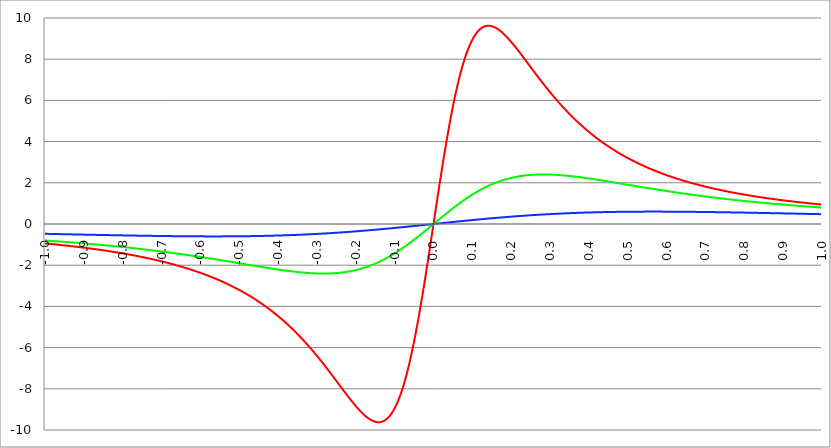
| Category | Series 1 | Series 0 | Series 2 |
|---|---|---|---|
| -1.0 | -0.943 | -0.8 | -0.476 |
| -0.999 | -0.945 | -0.802 | -0.477 |
| -0.998 | -0.946 | -0.803 | -0.477 |
| -0.997 | -0.948 | -0.804 | -0.477 |
| -0.996 | -0.95 | -0.806 | -0.478 |
| -0.995 | -0.952 | -0.807 | -0.478 |
| -0.994 | -0.954 | -0.808 | -0.479 |
| -0.993 | -0.955 | -0.809 | -0.479 |
| -0.992 | -0.957 | -0.811 | -0.479 |
| -0.991 | -0.959 | -0.812 | -0.48 |
| -0.99 | -0.961 | -0.813 | -0.48 |
| -0.989 | -0.963 | -0.815 | -0.48 |
| -0.988 | -0.965 | -0.816 | -0.481 |
| -0.987 | -0.966 | -0.817 | -0.481 |
| -0.986 | -0.968 | -0.818 | -0.482 |
| -0.985 | -0.97 | -0.82 | -0.482 |
| -0.984 | -0.972 | -0.821 | -0.482 |
| -0.983 | -0.974 | -0.822 | -0.483 |
| -0.982 | -0.976 | -0.824 | -0.483 |
| -0.981 | -0.978 | -0.825 | -0.484 |
| -0.98 | -0.979 | -0.826 | -0.484 |
| -0.979 | -0.981 | -0.828 | -0.484 |
| -0.978 | -0.983 | -0.829 | -0.485 |
| -0.977 | -0.985 | -0.83 | -0.485 |
| -0.976 | -0.987 | -0.832 | -0.486 |
| -0.975 | -0.989 | -0.833 | -0.486 |
| -0.974 | -0.991 | -0.834 | -0.486 |
| -0.973 | -0.993 | -0.836 | -0.487 |
| -0.972 | -0.995 | -0.837 | -0.487 |
| -0.971 | -0.997 | -0.838 | -0.488 |
| -0.97 | -0.998 | -0.84 | -0.488 |
| -0.969 | -1 | -0.841 | -0.488 |
| -0.968 | -1.002 | -0.842 | -0.489 |
| -0.967 | -1.004 | -0.844 | -0.489 |
| -0.966 | -1.006 | -0.845 | -0.49 |
| -0.965 | -1.008 | -0.847 | -0.49 |
| -0.964 | -1.01 | -0.848 | -0.49 |
| -0.963 | -1.012 | -0.849 | -0.491 |
| -0.962 | -1.014 | -0.851 | -0.491 |
| -0.961 | -1.016 | -0.852 | -0.492 |
| -0.96 | -1.018 | -0.853 | -0.492 |
| -0.959 | -1.02 | -0.855 | -0.492 |
| -0.958 | -1.022 | -0.856 | -0.493 |
| -0.957 | -1.024 | -0.858 | -0.493 |
| -0.956 | -1.026 | -0.859 | -0.494 |
| -0.955 | -1.028 | -0.86 | -0.494 |
| -0.954 | -1.03 | -0.862 | -0.494 |
| -0.953 | -1.032 | -0.863 | -0.495 |
| -0.952 | -1.034 | -0.865 | -0.495 |
| -0.951 | -1.036 | -0.866 | -0.495 |
| -0.95 | -1.038 | -0.867 | -0.496 |
| -0.949 | -1.04 | -0.869 | -0.496 |
| -0.948 | -1.042 | -0.87 | -0.497 |
| -0.947 | -1.044 | -0.872 | -0.497 |
| -0.946 | -1.046 | -0.873 | -0.497 |
| -0.945 | -1.049 | -0.875 | -0.498 |
| -0.944 | -1.051 | -0.876 | -0.498 |
| -0.943 | -1.053 | -0.877 | -0.499 |
| -0.942 | -1.055 | -0.879 | -0.499 |
| -0.941 | -1.057 | -0.88 | -0.499 |
| -0.94 | -1.059 | -0.882 | -0.5 |
| -0.939 | -1.061 | -0.883 | -0.5 |
| -0.938 | -1.063 | -0.885 | -0.501 |
| -0.937 | -1.065 | -0.886 | -0.501 |
| -0.936 | -1.067 | -0.888 | -0.501 |
| -0.935 | -1.07 | -0.889 | -0.502 |
| -0.934 | -1.072 | -0.89 | -0.502 |
| -0.933 | -1.074 | -0.892 | -0.503 |
| -0.932 | -1.076 | -0.893 | -0.503 |
| -0.931 | -1.078 | -0.895 | -0.503 |
| -0.93 | -1.08 | -0.896 | -0.504 |
| -0.929 | -1.083 | -0.898 | -0.504 |
| -0.928 | -1.085 | -0.899 | -0.505 |
| -0.927 | -1.087 | -0.901 | -0.505 |
| -0.926 | -1.089 | -0.902 | -0.505 |
| -0.925 | -1.091 | -0.904 | -0.506 |
| -0.924 | -1.094 | -0.905 | -0.506 |
| -0.923 | -1.096 | -0.907 | -0.507 |
| -0.922 | -1.098 | -0.908 | -0.507 |
| -0.921 | -1.1 | -0.91 | -0.507 |
| -0.92 | -1.102 | -0.911 | -0.508 |
| -0.919 | -1.105 | -0.913 | -0.508 |
| -0.918 | -1.107 | -0.914 | -0.508 |
| -0.917 | -1.109 | -0.916 | -0.509 |
| -0.916 | -1.111 | -0.917 | -0.509 |
| -0.915 | -1.114 | -0.919 | -0.51 |
| -0.914 | -1.116 | -0.92 | -0.51 |
| -0.913 | -1.118 | -0.922 | -0.51 |
| -0.912 | -1.12 | -0.923 | -0.511 |
| -0.911 | -1.123 | -0.925 | -0.511 |
| -0.91 | -1.125 | -0.926 | -0.512 |
| -0.909 | -1.127 | -0.928 | -0.512 |
| -0.908 | -1.13 | -0.93 | -0.512 |
| -0.907 | -1.132 | -0.931 | -0.513 |
| -0.906 | -1.134 | -0.933 | -0.513 |
| -0.905 | -1.137 | -0.934 | -0.514 |
| -0.904 | -1.139 | -0.936 | -0.514 |
| -0.903 | -1.141 | -0.937 | -0.514 |
| -0.902 | -1.144 | -0.939 | -0.515 |
| -0.901 | -1.146 | -0.94 | -0.515 |
| -0.9 | -1.148 | -0.942 | -0.515 |
| -0.899 | -1.151 | -0.944 | -0.516 |
| -0.898 | -1.153 | -0.945 | -0.516 |
| -0.897 | -1.156 | -0.947 | -0.517 |
| -0.896 | -1.158 | -0.948 | -0.517 |
| -0.895 | -1.16 | -0.95 | -0.517 |
| -0.894 | -1.163 | -0.952 | -0.518 |
| -0.893 | -1.165 | -0.953 | -0.518 |
| -0.892 | -1.168 | -0.955 | -0.519 |
| -0.891 | -1.17 | -0.956 | -0.519 |
| -0.89 | -1.173 | -0.958 | -0.519 |
| -0.889 | -1.175 | -0.96 | -0.52 |
| -0.888 | -1.177 | -0.961 | -0.52 |
| -0.887 | -1.18 | -0.963 | -0.52 |
| -0.886 | -1.182 | -0.964 | -0.521 |
| -0.885 | -1.185 | -0.966 | -0.521 |
| -0.884 | -1.187 | -0.968 | -0.522 |
| -0.883 | -1.19 | -0.969 | -0.522 |
| -0.882 | -1.192 | -0.971 | -0.522 |
| -0.881 | -1.195 | -0.973 | -0.523 |
| -0.88 | -1.197 | -0.974 | -0.523 |
| -0.879 | -1.2 | -0.976 | -0.524 |
| -0.878 | -1.202 | -0.978 | -0.524 |
| -0.877 | -1.205 | -0.979 | -0.524 |
| -0.876 | -1.208 | -0.981 | -0.525 |
| -0.875 | -1.21 | -0.983 | -0.525 |
| -0.874 | -1.213 | -0.984 | -0.525 |
| -0.873 | -1.215 | -0.986 | -0.526 |
| -0.872 | -1.218 | -0.988 | -0.526 |
| -0.871 | -1.22 | -0.989 | -0.527 |
| -0.87 | -1.223 | -0.991 | -0.527 |
| -0.869 | -1.226 | -0.993 | -0.527 |
| -0.868 | -1.228 | -0.994 | -0.528 |
| -0.867 | -1.231 | -0.996 | -0.528 |
| -0.866 | -1.233 | -0.998 | -0.528 |
| -0.865 | -1.236 | -0.999 | -0.529 |
| -0.864 | -1.239 | -1.001 | -0.529 |
| -0.863 | -1.241 | -1.003 | -0.53 |
| -0.862 | -1.244 | -1.004 | -0.53 |
| -0.861 | -1.247 | -1.006 | -0.53 |
| -0.86 | -1.249 | -1.008 | -0.531 |
| -0.859 | -1.252 | -1.01 | -0.531 |
| -0.858 | -1.255 | -1.011 | -0.531 |
| -0.857 | -1.257 | -1.013 | -0.532 |
| -0.856 | -1.26 | -1.015 | -0.532 |
| -0.855 | -1.263 | -1.017 | -0.533 |
| -0.854 | -1.266 | -1.018 | -0.533 |
| -0.853 | -1.268 | -1.02 | -0.533 |
| -0.852 | -1.271 | -1.022 | -0.534 |
| -0.851 | -1.274 | -1.024 | -0.534 |
| -0.85 | -1.277 | -1.025 | -0.534 |
| -0.849 | -1.279 | -1.027 | -0.535 |
| -0.848 | -1.282 | -1.029 | -0.535 |
| -0.847 | -1.285 | -1.031 | -0.536 |
| -0.846 | -1.288 | -1.032 | -0.536 |
| -0.845 | -1.291 | -1.034 | -0.536 |
| -0.844 | -1.293 | -1.036 | -0.537 |
| -0.843 | -1.296 | -1.038 | -0.537 |
| -0.842 | -1.299 | -1.039 | -0.537 |
| -0.841 | -1.302 | -1.041 | -0.538 |
| -0.84 | -1.305 | -1.043 | -0.538 |
| -0.839 | -1.308 | -1.045 | -0.539 |
| -0.838 | -1.31 | -1.047 | -0.539 |
| -0.837 | -1.313 | -1.048 | -0.539 |
| -0.836 | -1.316 | -1.05 | -0.54 |
| -0.835 | -1.319 | -1.052 | -0.54 |
| -0.834 | -1.322 | -1.054 | -0.54 |
| -0.833 | -1.325 | -1.056 | -0.541 |
| -0.832 | -1.328 | -1.058 | -0.541 |
| -0.831 | -1.331 | -1.059 | -0.541 |
| -0.83 | -1.334 | -1.061 | -0.542 |
| -0.829 | -1.337 | -1.063 | -0.542 |
| -0.828 | -1.34 | -1.065 | -0.543 |
| -0.827 | -1.343 | -1.067 | -0.543 |
| -0.826 | -1.346 | -1.069 | -0.543 |
| -0.825 | -1.349 | -1.07 | -0.544 |
| -0.824 | -1.352 | -1.072 | -0.544 |
| -0.823 | -1.355 | -1.074 | -0.544 |
| -0.822 | -1.358 | -1.076 | -0.545 |
| -0.821 | -1.361 | -1.078 | -0.545 |
| -0.82 | -1.364 | -1.08 | -0.545 |
| -0.819 | -1.367 | -1.082 | -0.546 |
| -0.818 | -1.37 | -1.083 | -0.546 |
| -0.817 | -1.373 | -1.085 | -0.546 |
| -0.816 | -1.376 | -1.087 | -0.547 |
| -0.815 | -1.379 | -1.089 | -0.547 |
| -0.814 | -1.382 | -1.091 | -0.548 |
| -0.813 | -1.385 | -1.093 | -0.548 |
| -0.812 | -1.388 | -1.095 | -0.548 |
| -0.811 | -1.392 | -1.097 | -0.549 |
| -0.81 | -1.395 | -1.099 | -0.549 |
| -0.809 | -1.398 | -1.101 | -0.549 |
| -0.808 | -1.401 | -1.103 | -0.55 |
| -0.807 | -1.404 | -1.104 | -0.55 |
| -0.806 | -1.407 | -1.106 | -0.55 |
| -0.805 | -1.411 | -1.108 | -0.551 |
| -0.804 | -1.414 | -1.11 | -0.551 |
| -0.803 | -1.417 | -1.112 | -0.551 |
| -0.802 | -1.42 | -1.114 | -0.552 |
| -0.801 | -1.423 | -1.116 | -0.552 |
| -0.8 | -1.427 | -1.118 | -0.552 |
| -0.799 | -1.43 | -1.12 | -0.553 |
| -0.798 | -1.433 | -1.122 | -0.553 |
| -0.797 | -1.436 | -1.124 | -0.553 |
| -0.796 | -1.44 | -1.126 | -0.554 |
| -0.795 | -1.443 | -1.128 | -0.554 |
| -0.794 | -1.446 | -1.13 | -0.554 |
| -0.793 | -1.45 | -1.132 | -0.555 |
| -0.792 | -1.453 | -1.134 | -0.555 |
| -0.791 | -1.456 | -1.136 | -0.556 |
| -0.79 | -1.46 | -1.138 | -0.556 |
| -0.789 | -1.463 | -1.14 | -0.556 |
| -0.788 | -1.466 | -1.142 | -0.557 |
| -0.787 | -1.47 | -1.144 | -0.557 |
| -0.786 | -1.473 | -1.146 | -0.557 |
| -0.785 | -1.477 | -1.148 | -0.558 |
| -0.784 | -1.48 | -1.15 | -0.558 |
| -0.783 | -1.484 | -1.152 | -0.558 |
| -0.782 | -1.487 | -1.154 | -0.559 |
| -0.781 | -1.49 | -1.156 | -0.559 |
| -0.78 | -1.494 | -1.158 | -0.559 |
| -0.779 | -1.497 | -1.16 | -0.56 |
| -0.778 | -1.501 | -1.162 | -0.56 |
| -0.777 | -1.504 | -1.164 | -0.56 |
| -0.776 | -1.508 | -1.166 | -0.561 |
| -0.775 | -1.511 | -1.168 | -0.561 |
| -0.774 | -1.515 | -1.17 | -0.561 |
| -0.773 | -1.519 | -1.172 | -0.561 |
| -0.772 | -1.522 | -1.174 | -0.562 |
| -0.771 | -1.526 | -1.177 | -0.562 |
| -0.77 | -1.529 | -1.179 | -0.562 |
| -0.769 | -1.533 | -1.181 | -0.563 |
| -0.768 | -1.536 | -1.183 | -0.563 |
| -0.767 | -1.54 | -1.185 | -0.563 |
| -0.766 | -1.544 | -1.187 | -0.564 |
| -0.765 | -1.547 | -1.189 | -0.564 |
| -0.764 | -1.551 | -1.191 | -0.564 |
| -0.763 | -1.555 | -1.193 | -0.565 |
| -0.762 | -1.558 | -1.195 | -0.565 |
| -0.761 | -1.562 | -1.198 | -0.565 |
| -0.76 | -1.566 | -1.2 | -0.566 |
| -0.759 | -1.57 | -1.202 | -0.566 |
| -0.758 | -1.573 | -1.204 | -0.566 |
| -0.757 | -1.577 | -1.206 | -0.567 |
| -0.756 | -1.581 | -1.208 | -0.567 |
| -0.755 | -1.585 | -1.21 | -0.567 |
| -0.754 | -1.588 | -1.213 | -0.568 |
| -0.753 | -1.592 | -1.215 | -0.568 |
| -0.752 | -1.596 | -1.217 | -0.568 |
| -0.751 | -1.6 | -1.219 | -0.568 |
| -0.75 | -1.604 | -1.221 | -0.569 |
| -0.749 | -1.608 | -1.223 | -0.569 |
| -0.748 | -1.611 | -1.226 | -0.569 |
| -0.747 | -1.615 | -1.228 | -0.57 |
| -0.746 | -1.619 | -1.23 | -0.57 |
| -0.745 | -1.623 | -1.232 | -0.57 |
| -0.744 | -1.627 | -1.234 | -0.571 |
| -0.743 | -1.631 | -1.237 | -0.571 |
| -0.742 | -1.635 | -1.239 | -0.571 |
| -0.741 | -1.639 | -1.241 | -0.571 |
| -0.74 | -1.643 | -1.243 | -0.572 |
| -0.739 | -1.647 | -1.245 | -0.572 |
| -0.738 | -1.651 | -1.248 | -0.572 |
| -0.737 | -1.655 | -1.25 | -0.573 |
| -0.736 | -1.659 | -1.252 | -0.573 |
| -0.735 | -1.663 | -1.254 | -0.573 |
| -0.734 | -1.667 | -1.257 | -0.574 |
| -0.733 | -1.671 | -1.259 | -0.574 |
| -0.732 | -1.675 | -1.261 | -0.574 |
| -0.731 | -1.679 | -1.263 | -0.574 |
| -0.73 | -1.683 | -1.266 | -0.575 |
| -0.729 | -1.688 | -1.268 | -0.575 |
| -0.728 | -1.692 | -1.27 | -0.575 |
| -0.727 | -1.696 | -1.272 | -0.576 |
| -0.726 | -1.7 | -1.275 | -0.576 |
| -0.725 | -1.704 | -1.277 | -0.576 |
| -0.724 | -1.709 | -1.279 | -0.576 |
| -0.723 | -1.713 | -1.282 | -0.577 |
| -0.722 | -1.717 | -1.284 | -0.577 |
| -0.721 | -1.721 | -1.286 | -0.577 |
| -0.72 | -1.725 | -1.289 | -0.577 |
| -0.719 | -1.73 | -1.291 | -0.578 |
| -0.718 | -1.734 | -1.293 | -0.578 |
| -0.717 | -1.738 | -1.296 | -0.578 |
| -0.716 | -1.743 | -1.298 | -0.579 |
| -0.715 | -1.747 | -1.3 | -0.579 |
| -0.714 | -1.751 | -1.303 | -0.579 |
| -0.713 | -1.756 | -1.305 | -0.579 |
| -0.712 | -1.76 | -1.307 | -0.58 |
| -0.711 | -1.765 | -1.31 | -0.58 |
| -0.71 | -1.769 | -1.312 | -0.58 |
| -0.709 | -1.773 | -1.314 | -0.58 |
| -0.708 | -1.778 | -1.317 | -0.581 |
| -0.707 | -1.782 | -1.319 | -0.581 |
| -0.706 | -1.787 | -1.321 | -0.581 |
| -0.705 | -1.791 | -1.324 | -0.581 |
| -0.704 | -1.796 | -1.326 | -0.582 |
| -0.703 | -1.8 | -1.329 | -0.582 |
| -0.702 | -1.805 | -1.331 | -0.582 |
| -0.701 | -1.81 | -1.333 | -0.582 |
| -0.7 | -1.814 | -1.336 | -0.583 |
| -0.699 | -1.819 | -1.338 | -0.583 |
| -0.698 | -1.823 | -1.341 | -0.583 |
| -0.697 | -1.828 | -1.343 | -0.583 |
| -0.696 | -1.833 | -1.345 | -0.584 |
| -0.695 | -1.837 | -1.348 | -0.584 |
| -0.694 | -1.842 | -1.35 | -0.584 |
| -0.693 | -1.847 | -1.353 | -0.584 |
| -0.692 | -1.852 | -1.355 | -0.585 |
| -0.691 | -1.856 | -1.358 | -0.585 |
| -0.69 | -1.861 | -1.36 | -0.585 |
| -0.689 | -1.866 | -1.363 | -0.585 |
| -0.688 | -1.871 | -1.365 | -0.586 |
| -0.687 | -1.875 | -1.367 | -0.586 |
| -0.686 | -1.88 | -1.37 | -0.586 |
| -0.685 | -1.885 | -1.372 | -0.586 |
| -0.684 | -1.89 | -1.375 | -0.587 |
| -0.683 | -1.895 | -1.377 | -0.587 |
| -0.682 | -1.9 | -1.38 | -0.587 |
| -0.681 | -1.905 | -1.382 | -0.587 |
| -0.68 | -1.91 | -1.385 | -0.587 |
| -0.679 | -1.915 | -1.387 | -0.588 |
| -0.678 | -1.919 | -1.39 | -0.588 |
| -0.677 | -1.924 | -1.392 | -0.588 |
| -0.676 | -1.929 | -1.395 | -0.588 |
| -0.675 | -1.935 | -1.397 | -0.589 |
| -0.674 | -1.94 | -1.4 | -0.589 |
| -0.673 | -1.945 | -1.402 | -0.589 |
| -0.672 | -1.95 | -1.405 | -0.589 |
| -0.671 | -1.955 | -1.408 | -0.589 |
| -0.67 | -1.96 | -1.41 | -0.59 |
| -0.669 | -1.965 | -1.413 | -0.59 |
| -0.668 | -1.97 | -1.415 | -0.59 |
| -0.667 | -1.975 | -1.418 | -0.59 |
| -0.666 | -1.981 | -1.42 | -0.59 |
| -0.665 | -1.986 | -1.423 | -0.591 |
| -0.664 | -1.991 | -1.426 | -0.591 |
| -0.663 | -1.996 | -1.428 | -0.591 |
| -0.662 | -2.002 | -1.431 | -0.591 |
| -0.661 | -2.007 | -1.433 | -0.591 |
| -0.66 | -2.012 | -1.436 | -0.592 |
| -0.659 | -2.018 | -1.438 | -0.592 |
| -0.658 | -2.023 | -1.441 | -0.592 |
| -0.657 | -2.028 | -1.444 | -0.592 |
| -0.656 | -2.034 | -1.446 | -0.592 |
| -0.655 | -2.039 | -1.449 | -0.593 |
| -0.654 | -2.045 | -1.452 | -0.593 |
| -0.653 | -2.05 | -1.454 | -0.593 |
| -0.652 | -2.056 | -1.457 | -0.593 |
| -0.651 | -2.061 | -1.459 | -0.593 |
| -0.65 | -2.067 | -1.462 | -0.593 |
| -0.649 | -2.072 | -1.465 | -0.594 |
| -0.648 | -2.078 | -1.467 | -0.594 |
| -0.647 | -2.083 | -1.47 | -0.594 |
| -0.646 | -2.089 | -1.473 | -0.594 |
| -0.645 | -2.094 | -1.475 | -0.594 |
| -0.644 | -2.1 | -1.478 | -0.595 |
| -0.643 | -2.106 | -1.481 | -0.595 |
| -0.642 | -2.111 | -1.483 | -0.595 |
| -0.641 | -2.117 | -1.486 | -0.595 |
| -0.64 | -2.123 | -1.489 | -0.595 |
| -0.639 | -2.129 | -1.491 | -0.595 |
| -0.638 | -2.134 | -1.494 | -0.595 |
| -0.637 | -2.14 | -1.497 | -0.596 |
| -0.636 | -2.146 | -1.5 | -0.596 |
| -0.635 | -2.152 | -1.502 | -0.596 |
| -0.634 | -2.158 | -1.505 | -0.596 |
| -0.633 | -2.164 | -1.508 | -0.596 |
| -0.632 | -2.17 | -1.51 | -0.596 |
| -0.631 | -2.176 | -1.513 | -0.597 |
| -0.63 | -2.182 | -1.516 | -0.597 |
| -0.629 | -2.188 | -1.519 | -0.597 |
| -0.628 | -2.194 | -1.521 | -0.597 |
| -0.627 | -2.2 | -1.524 | -0.597 |
| -0.626 | -2.206 | -1.527 | -0.597 |
| -0.625 | -2.212 | -1.53 | -0.597 |
| -0.624 | -2.218 | -1.532 | -0.597 |
| -0.623 | -2.224 | -1.535 | -0.598 |
| -0.622 | -2.23 | -1.538 | -0.598 |
| -0.621 | -2.236 | -1.541 | -0.598 |
| -0.62 | -2.242 | -1.544 | -0.598 |
| -0.619 | -2.249 | -1.546 | -0.598 |
| -0.618 | -2.255 | -1.549 | -0.598 |
| -0.617 | -2.261 | -1.552 | -0.598 |
| -0.616 | -2.268 | -1.555 | -0.598 |
| -0.615 | -2.274 | -1.558 | -0.599 |
| -0.614 | -2.28 | -1.56 | -0.599 |
| -0.613 | -2.287 | -1.563 | -0.599 |
| -0.612 | -2.293 | -1.566 | -0.599 |
| -0.611 | -2.299 | -1.569 | -0.599 |
| -0.61 | -2.306 | -1.572 | -0.599 |
| -0.609 | -2.312 | -1.574 | -0.599 |
| -0.608 | -2.319 | -1.577 | -0.599 |
| -0.607 | -2.325 | -1.58 | -0.599 |
| -0.606 | -2.332 | -1.583 | -0.599 |
| -0.605 | -2.338 | -1.586 | -0.6 |
| -0.604 | -2.345 | -1.589 | -0.6 |
| -0.603 | -2.352 | -1.592 | -0.6 |
| -0.602 | -2.358 | -1.594 | -0.6 |
| -0.601 | -2.365 | -1.597 | -0.6 |
| -0.6 | -2.372 | -1.6 | -0.6 |
| -0.599 | -2.378 | -1.603 | -0.6 |
| -0.598 | -2.385 | -1.606 | -0.6 |
| -0.597 | -2.392 | -1.609 | -0.6 |
| -0.596 | -2.399 | -1.612 | -0.6 |
| -0.595 | -2.406 | -1.615 | -0.6 |
| -0.594 | -2.413 | -1.617 | -0.6 |
| -0.593 | -2.419 | -1.62 | -0.601 |
| -0.592 | -2.426 | -1.623 | -0.601 |
| -0.591 | -2.433 | -1.626 | -0.601 |
| -0.59 | -2.44 | -1.629 | -0.601 |
| -0.589 | -2.447 | -1.632 | -0.601 |
| -0.588 | -2.454 | -1.635 | -0.601 |
| -0.587 | -2.461 | -1.638 | -0.601 |
| -0.586 | -2.468 | -1.641 | -0.601 |
| -0.585 | -2.476 | -1.644 | -0.601 |
| -0.584 | -2.483 | -1.647 | -0.601 |
| -0.583 | -2.49 | -1.65 | -0.601 |
| -0.582 | -2.497 | -1.652 | -0.601 |
| -0.581 | -2.504 | -1.655 | -0.601 |
| -0.58 | -2.512 | -1.658 | -0.601 |
| -0.579 | -2.519 | -1.661 | -0.601 |
| -0.578 | -2.526 | -1.664 | -0.601 |
| -0.577 | -2.534 | -1.667 | -0.601 |
| -0.576 | -2.541 | -1.67 | -0.601 |
| -0.575 | -2.548 | -1.673 | -0.601 |
| -0.574 | -2.556 | -1.676 | -0.601 |
| -0.573 | -2.563 | -1.679 | -0.601 |
| -0.572 | -2.571 | -1.682 | -0.601 |
| -0.571 | -2.578 | -1.685 | -0.601 |
| -0.57 | -2.586 | -1.688 | -0.601 |
| -0.569 | -2.594 | -1.691 | -0.601 |
| -0.568 | -2.601 | -1.694 | -0.601 |
| -0.567 | -2.609 | -1.697 | -0.601 |
| -0.566 | -2.616 | -1.7 | -0.601 |
| -0.565 | -2.624 | -1.703 | -0.601 |
| -0.564 | -2.632 | -1.706 | -0.601 |
| -0.563 | -2.64 | -1.709 | -0.601 |
| -0.562 | -2.648 | -1.712 | -0.601 |
| -0.561 | -2.655 | -1.715 | -0.601 |
| -0.56 | -2.663 | -1.718 | -0.601 |
| -0.559 | -2.671 | -1.721 | -0.601 |
| -0.558 | -2.679 | -1.724 | -0.601 |
| -0.557 | -2.687 | -1.727 | -0.601 |
| -0.556 | -2.695 | -1.73 | -0.601 |
| -0.555 | -2.703 | -1.733 | -0.601 |
| -0.554 | -2.711 | -1.736 | -0.601 |
| -0.553 | -2.719 | -1.739 | -0.601 |
| -0.552 | -2.728 | -1.743 | -0.601 |
| -0.551 | -2.736 | -1.746 | -0.601 |
| -0.55 | -2.744 | -1.749 | -0.601 |
| -0.549 | -2.752 | -1.752 | -0.601 |
| -0.548 | -2.76 | -1.755 | -0.601 |
| -0.547 | -2.769 | -1.758 | -0.601 |
| -0.546 | -2.777 | -1.761 | -0.601 |
| -0.545 | -2.786 | -1.764 | -0.601 |
| -0.544 | -2.794 | -1.767 | -0.601 |
| -0.543 | -2.802 | -1.77 | -0.601 |
| -0.542 | -2.811 | -1.773 | -0.601 |
| -0.541 | -2.819 | -1.776 | -0.601 |
| -0.54 | -2.828 | -1.779 | -0.601 |
| -0.539 | -2.837 | -1.782 | -0.6 |
| -0.538 | -2.845 | -1.786 | -0.6 |
| -0.537 | -2.854 | -1.789 | -0.6 |
| -0.536 | -2.863 | -1.792 | -0.6 |
| -0.535 | -2.871 | -1.795 | -0.6 |
| -0.534 | -2.88 | -1.798 | -0.6 |
| -0.533 | -2.889 | -1.801 | -0.6 |
| -0.532 | -2.898 | -1.804 | -0.6 |
| -0.531 | -2.907 | -1.807 | -0.6 |
| -0.53 | -2.916 | -1.81 | -0.6 |
| -0.529 | -2.925 | -1.813 | -0.6 |
| -0.528 | -2.934 | -1.817 | -0.6 |
| -0.527 | -2.943 | -1.82 | -0.599 |
| -0.526 | -2.952 | -1.823 | -0.599 |
| -0.525 | -2.961 | -1.826 | -0.599 |
| -0.524 | -2.97 | -1.829 | -0.599 |
| -0.523 | -2.979 | -1.832 | -0.599 |
| -0.522 | -2.988 | -1.835 | -0.599 |
| -0.521 | -2.998 | -1.838 | -0.599 |
| -0.52 | -3.007 | -1.842 | -0.599 |
| -0.519 | -3.016 | -1.845 | -0.598 |
| -0.518 | -3.026 | -1.848 | -0.598 |
| -0.517 | -3.035 | -1.851 | -0.598 |
| -0.516 | -3.045 | -1.854 | -0.598 |
| -0.515 | -3.054 | -1.857 | -0.598 |
| -0.514 | -3.064 | -1.86 | -0.598 |
| -0.513 | -3.073 | -1.864 | -0.598 |
| -0.512 | -3.083 | -1.867 | -0.598 |
| -0.511 | -3.092 | -1.87 | -0.597 |
| -0.51 | -3.102 | -1.873 | -0.597 |
| -0.509 | -3.112 | -1.876 | -0.597 |
| -0.508 | -3.122 | -1.879 | -0.597 |
| -0.507 | -3.132 | -1.882 | -0.597 |
| -0.506 | -3.141 | -1.886 | -0.597 |
| -0.505 | -3.151 | -1.889 | -0.596 |
| -0.504 | -3.161 | -1.892 | -0.596 |
| -0.503 | -3.171 | -1.895 | -0.596 |
| -0.502 | -3.181 | -1.898 | -0.596 |
| -0.501 | -3.192 | -1.901 | -0.596 |
| -0.5 | -3.202 | -1.905 | -0.596 |
| -0.499 | -3.212 | -1.908 | -0.595 |
| -0.498 | -3.222 | -1.911 | -0.595 |
| -0.497 | -3.232 | -1.914 | -0.595 |
| -0.496 | -3.243 | -1.917 | -0.595 |
| -0.495 | -3.253 | -1.92 | -0.595 |
| -0.494 | -3.263 | -1.924 | -0.594 |
| -0.493 | -3.274 | -1.927 | -0.594 |
| -0.492 | -3.284 | -1.93 | -0.594 |
| -0.491 | -3.295 | -1.933 | -0.594 |
| -0.49 | -3.305 | -1.936 | -0.593 |
| -0.489 | -3.316 | -1.939 | -0.593 |
| -0.488 | -3.327 | -1.942 | -0.593 |
| -0.487 | -3.337 | -1.946 | -0.593 |
| -0.486 | -3.348 | -1.949 | -0.593 |
| -0.485 | -3.359 | -1.952 | -0.592 |
| -0.484 | -3.37 | -1.955 | -0.592 |
| -0.483 | -3.381 | -1.958 | -0.592 |
| -0.482 | -3.392 | -1.961 | -0.592 |
| -0.481 | -3.403 | -1.965 | -0.591 |
| -0.48 | -3.414 | -1.968 | -0.591 |
| -0.479 | -3.425 | -1.971 | -0.591 |
| -0.478 | -3.436 | -1.974 | -0.591 |
| -0.477 | -3.447 | -1.977 | -0.59 |
| -0.476 | -3.458 | -1.98 | -0.59 |
| -0.475 | -3.47 | -1.984 | -0.59 |
| -0.474 | -3.481 | -1.987 | -0.59 |
| -0.473 | -3.492 | -1.99 | -0.589 |
| -0.472 | -3.504 | -1.993 | -0.589 |
| -0.471 | -3.515 | -1.996 | -0.589 |
| -0.469999999999999 | -3.527 | -1.999 | -0.588 |
| -0.468999999999999 | -3.538 | -2.002 | -0.588 |
| -0.467999999999999 | -3.55 | -2.006 | -0.588 |
| -0.466999999999999 | -3.562 | -2.009 | -0.588 |
| -0.465999999999999 | -3.573 | -2.012 | -0.587 |
| -0.464999999999999 | -3.585 | -2.015 | -0.587 |
| -0.463999999999999 | -3.597 | -2.018 | -0.587 |
| -0.462999999999999 | -3.609 | -2.021 | -0.586 |
| -0.461999999999999 | -3.621 | -2.024 | -0.586 |
| -0.460999999999999 | -3.633 | -2.028 | -0.586 |
| -0.459999999999999 | -3.645 | -2.031 | -0.585 |
| -0.458999999999999 | -3.657 | -2.034 | -0.585 |
| -0.457999999999999 | -3.669 | -2.037 | -0.585 |
| -0.456999999999999 | -3.681 | -2.04 | -0.584 |
| -0.455999999999999 | -3.694 | -2.043 | -0.584 |
| -0.454999999999999 | -3.706 | -2.046 | -0.584 |
| -0.453999999999999 | -3.718 | -2.049 | -0.583 |
| -0.452999999999999 | -3.731 | -2.053 | -0.583 |
| -0.451999999999999 | -3.743 | -2.056 | -0.583 |
| -0.450999999999999 | -3.756 | -2.059 | -0.582 |
| -0.449999999999999 | -3.768 | -2.062 | -0.582 |
| -0.448999999999999 | -3.781 | -2.065 | -0.582 |
| -0.447999999999999 | -3.794 | -2.068 | -0.581 |
| -0.446999999999999 | -3.806 | -2.071 | -0.581 |
| -0.445999999999999 | -3.819 | -2.074 | -0.58 |
| -0.444999999999999 | -3.832 | -2.077 | -0.58 |
| -0.443999999999999 | -3.845 | -2.08 | -0.58 |
| -0.442999999999999 | -3.858 | -2.083 | -0.579 |
| -0.441999999999999 | -3.871 | -2.086 | -0.579 |
| -0.440999999999999 | -3.884 | -2.09 | -0.579 |
| -0.439999999999999 | -3.897 | -2.093 | -0.578 |
| -0.438999999999999 | -3.91 | -2.096 | -0.578 |
| -0.437999999999999 | -3.924 | -2.099 | -0.577 |
| -0.436999999999999 | -3.937 | -2.102 | -0.577 |
| -0.435999999999999 | -3.95 | -2.105 | -0.576 |
| -0.434999999999999 | -3.964 | -2.108 | -0.576 |
| -0.433999999999999 | -3.977 | -2.111 | -0.576 |
| -0.432999999999999 | -3.991 | -2.114 | -0.575 |
| -0.431999999999999 | -4.004 | -2.117 | -0.575 |
| -0.430999999999999 | -4.018 | -2.12 | -0.574 |
| -0.429999999999999 | -4.032 | -2.123 | -0.574 |
| -0.428999999999999 | -4.045 | -2.126 | -0.574 |
| -0.427999999999999 | -4.059 | -2.129 | -0.573 |
| -0.426999999999999 | -4.073 | -2.132 | -0.573 |
| -0.425999999999999 | -4.087 | -2.135 | -0.572 |
| -0.424999999999999 | -4.101 | -2.138 | -0.572 |
| -0.423999999999999 | -4.115 | -2.141 | -0.571 |
| -0.422999999999999 | -4.129 | -2.144 | -0.571 |
| -0.421999999999999 | -4.144 | -2.147 | -0.57 |
| -0.420999999999999 | -4.158 | -2.15 | -0.57 |
| -0.419999999999999 | -4.172 | -2.153 | -0.569 |
| -0.418999999999999 | -4.187 | -2.156 | -0.569 |
| -0.417999999999999 | -4.201 | -2.158 | -0.568 |
| -0.416999999999999 | -4.216 | -2.161 | -0.568 |
| -0.415999999999999 | -4.23 | -2.164 | -0.567 |
| -0.414999999999999 | -4.245 | -2.167 | -0.567 |
| -0.413999999999999 | -4.259 | -2.17 | -0.566 |
| -0.412999999999999 | -4.274 | -2.173 | -0.566 |
| -0.411999999999999 | -4.289 | -2.176 | -0.565 |
| -0.410999999999999 | -4.304 | -2.179 | -0.565 |
| -0.409999999999999 | -4.319 | -2.182 | -0.564 |
| -0.408999999999999 | -4.334 | -2.184 | -0.564 |
| -0.407999999999999 | -4.349 | -2.187 | -0.563 |
| -0.406999999999999 | -4.364 | -2.19 | -0.563 |
| -0.405999999999999 | -4.379 | -2.193 | -0.562 |
| -0.404999999999999 | -4.395 | -2.196 | -0.562 |
| -0.403999999999999 | -4.41 | -2.199 | -0.561 |
| -0.402999999999999 | -4.425 | -2.201 | -0.561 |
| -0.401999999999999 | -4.441 | -2.204 | -0.56 |
| -0.400999999999999 | -4.457 | -2.207 | -0.56 |
| -0.399999999999999 | -4.472 | -2.21 | -0.559 |
| -0.398999999999999 | -4.488 | -2.212 | -0.558 |
| -0.397999999999999 | -4.504 | -2.215 | -0.558 |
| -0.396999999999999 | -4.519 | -2.218 | -0.557 |
| -0.395999999999999 | -4.535 | -2.221 | -0.557 |
| -0.394999999999999 | -4.551 | -2.223 | -0.556 |
| -0.393999999999999 | -4.567 | -2.226 | -0.556 |
| -0.392999999999999 | -4.583 | -2.229 | -0.555 |
| -0.391999999999999 | -4.6 | -2.231 | -0.554 |
| -0.390999999999999 | -4.616 | -2.234 | -0.554 |
| -0.389999999999999 | -4.632 | -2.237 | -0.553 |
| -0.388999999999999 | -4.648 | -2.239 | -0.553 |
| -0.387999999999999 | -4.665 | -2.242 | -0.552 |
| -0.386999999999999 | -4.681 | -2.245 | -0.551 |
| -0.385999999999999 | -4.698 | -2.247 | -0.551 |
| -0.384999999999999 | -4.715 | -2.25 | -0.55 |
| -0.383999999999999 | -4.731 | -2.252 | -0.55 |
| -0.382999999999999 | -4.748 | -2.255 | -0.549 |
| -0.381999999999999 | -4.765 | -2.258 | -0.548 |
| -0.380999999999999 | -4.782 | -2.26 | -0.548 |
| -0.379999999999999 | -4.799 | -2.263 | -0.547 |
| -0.378999999999999 | -4.816 | -2.265 | -0.546 |
| -0.377999999999999 | -4.833 | -2.268 | -0.546 |
| -0.376999999999999 | -4.85 | -2.27 | -0.545 |
| -0.375999999999999 | -4.868 | -2.273 | -0.544 |
| -0.374999999999999 | -4.885 | -2.275 | -0.544 |
| -0.373999999999999 | -4.902 | -2.278 | -0.543 |
| -0.372999999999999 | -4.92 | -2.28 | -0.542 |
| -0.371999999999999 | -4.938 | -2.282 | -0.542 |
| -0.370999999999999 | -4.955 | -2.285 | -0.541 |
| -0.369999999999999 | -4.973 | -2.287 | -0.54 |
| -0.368999999999999 | -4.991 | -2.289 | -0.54 |
| -0.367999999999999 | -5.009 | -2.292 | -0.539 |
| -0.366999999999999 | -5.027 | -2.294 | -0.538 |
| -0.365999999999999 | -5.045 | -2.296 | -0.538 |
| -0.364999999999999 | -5.063 | -2.299 | -0.537 |
| -0.363999999999999 | -5.081 | -2.301 | -0.536 |
| -0.362999999999999 | -5.099 | -2.303 | -0.535 |
| -0.361999999999999 | -5.117 | -2.306 | -0.535 |
| -0.360999999999999 | -5.136 | -2.308 | -0.534 |
| -0.359999999999999 | -5.154 | -2.31 | -0.533 |
| -0.358999999999999 | -5.173 | -2.312 | -0.532 |
| -0.357999999999999 | -5.191 | -2.314 | -0.532 |
| -0.356999999999999 | -5.21 | -2.316 | -0.531 |
| -0.355999999999999 | -5.229 | -2.319 | -0.53 |
| -0.354999999999999 | -5.248 | -2.321 | -0.529 |
| -0.353999999999999 | -5.267 | -2.323 | -0.529 |
| -0.352999999999999 | -5.286 | -2.325 | -0.528 |
| -0.351999999999999 | -5.305 | -2.327 | -0.527 |
| -0.350999999999999 | -5.324 | -2.329 | -0.526 |
| -0.349999999999999 | -5.343 | -2.331 | -0.526 |
| -0.348999999999999 | -5.362 | -2.333 | -0.525 |
| -0.347999999999999 | -5.382 | -2.335 | -0.524 |
| -0.346999999999999 | -5.401 | -2.337 | -0.523 |
| -0.345999999999999 | -5.421 | -2.339 | -0.523 |
| -0.344999999999999 | -5.44 | -2.341 | -0.522 |
| -0.343999999999999 | -5.46 | -2.343 | -0.521 |
| -0.342999999999999 | -5.48 | -2.344 | -0.52 |
| -0.341999999999999 | -5.5 | -2.346 | -0.519 |
| -0.340999999999999 | -5.519 | -2.348 | -0.518 |
| -0.339999999999999 | -5.539 | -2.35 | -0.518 |
| -0.338999999999999 | -5.559 | -2.352 | -0.517 |
| -0.337999999999999 | -5.58 | -2.353 | -0.516 |
| -0.336999999999999 | -5.6 | -2.355 | -0.515 |
| -0.335999999999999 | -5.62 | -2.357 | -0.514 |
| -0.334999999999999 | -5.64 | -2.359 | -0.513 |
| -0.333999999999999 | -5.661 | -2.36 | -0.513 |
| -0.332999999999999 | -5.681 | -2.362 | -0.512 |
| -0.331999999999999 | -5.702 | -2.363 | -0.511 |
| -0.330999999999999 | -5.723 | -2.365 | -0.51 |
| -0.329999999999999 | -5.743 | -2.367 | -0.509 |
| -0.328999999999999 | -5.764 | -2.368 | -0.508 |
| -0.327999999999999 | -5.785 | -2.37 | -0.507 |
| -0.326999999999999 | -5.806 | -2.371 | -0.507 |
| -0.325999999999999 | -5.827 | -2.373 | -0.506 |
| -0.324999999999999 | -5.848 | -2.374 | -0.505 |
| -0.323999999999999 | -5.869 | -2.375 | -0.504 |
| -0.322999999999999 | -5.891 | -2.377 | -0.503 |
| -0.321999999999999 | -5.912 | -2.378 | -0.502 |
| -0.320999999999999 | -5.934 | -2.379 | -0.501 |
| -0.319999999999999 | -5.955 | -2.381 | -0.5 |
| -0.318999999999999 | -5.977 | -2.382 | -0.499 |
| -0.317999999999999 | -5.998 | -2.383 | -0.498 |
| -0.316999999999999 | -6.02 | -2.384 | -0.497 |
| -0.315999999999999 | -6.042 | -2.386 | -0.497 |
| -0.314999999999999 | -6.064 | -2.387 | -0.496 |
| -0.313999999999999 | -6.086 | -2.388 | -0.495 |
| -0.312999999999999 | -6.108 | -2.389 | -0.494 |
| -0.311999999999999 | -6.13 | -2.39 | -0.493 |
| -0.310999999999999 | -6.152 | -2.391 | -0.492 |
| -0.309999999999999 | -6.174 | -2.392 | -0.491 |
| -0.308999999999999 | -6.196 | -2.393 | -0.49 |
| -0.307999999999999 | -6.219 | -2.394 | -0.489 |
| -0.306999999999999 | -6.241 | -2.395 | -0.488 |
| -0.305999999999999 | -6.264 | -2.396 | -0.487 |
| -0.304999999999999 | -6.286 | -2.396 | -0.486 |
| -0.303999999999999 | -6.309 | -2.397 | -0.485 |
| -0.302999999999999 | -6.332 | -2.398 | -0.484 |
| -0.301999999999999 | -6.355 | -2.399 | -0.483 |
| -0.300999999999999 | -6.377 | -2.399 | -0.482 |
| -0.299999999999999 | -6.4 | -2.4 | -0.481 |
| -0.298999999999999 | -6.423 | -2.401 | -0.48 |
| -0.297999999999999 | -6.446 | -2.401 | -0.479 |
| -0.296999999999999 | -6.47 | -2.402 | -0.478 |
| -0.295999999999999 | -6.493 | -2.402 | -0.477 |
| -0.294999999999999 | -6.516 | -2.403 | -0.476 |
| -0.293999999999999 | -6.539 | -2.403 | -0.475 |
| -0.292999999999999 | -6.563 | -2.404 | -0.474 |
| -0.291999999999999 | -6.586 | -2.404 | -0.473 |
| -0.290999999999999 | -6.61 | -2.404 | -0.472 |
| -0.289999999999999 | -6.633 | -2.405 | -0.471 |
| -0.288999999999999 | -6.657 | -2.405 | -0.47 |
| -0.287999999999999 | -6.681 | -2.405 | -0.469 |
| -0.286999999999999 | -6.705 | -2.405 | -0.467 |
| -0.285999999999999 | -6.728 | -2.405 | -0.466 |
| -0.284999999999999 | -6.752 | -2.406 | -0.465 |
| -0.283999999999999 | -6.776 | -2.406 | -0.464 |
| -0.282999999999999 | -6.8 | -2.406 | -0.463 |
| -0.281999999999999 | -6.824 | -2.406 | -0.462 |
| -0.280999999999999 | -6.849 | -2.406 | -0.461 |
| -0.279999999999999 | -6.873 | -2.405 | -0.46 |
| -0.278999999999999 | -6.897 | -2.405 | -0.459 |
| -0.277999999999999 | -6.921 | -2.405 | -0.458 |
| -0.276999999999999 | -6.946 | -2.405 | -0.457 |
| -0.275999999999999 | -6.97 | -2.405 | -0.455 |
| -0.274999999999999 | -6.994 | -2.404 | -0.454 |
| -0.273999999999999 | -7.019 | -2.404 | -0.453 |
| -0.272999999999999 | -7.044 | -2.404 | -0.452 |
| -0.271999999999999 | -7.068 | -2.403 | -0.451 |
| -0.270999999999999 | -7.093 | -2.403 | -0.45 |
| -0.269999999999999 | -7.117 | -2.402 | -0.449 |
| -0.268999999999999 | -7.142 | -2.402 | -0.447 |
| -0.267999999999999 | -7.167 | -2.401 | -0.446 |
| -0.266999999999999 | -7.192 | -2.4 | -0.445 |
| -0.265999999999999 | -7.217 | -2.4 | -0.444 |
| -0.264999999999999 | -7.241 | -2.399 | -0.443 |
| -0.263999999999999 | -7.266 | -2.398 | -0.442 |
| -0.262999999999999 | -7.291 | -2.397 | -0.44 |
| -0.261999999999999 | -7.316 | -2.396 | -0.439 |
| -0.260999999999999 | -7.341 | -2.395 | -0.438 |
| -0.259999999999999 | -7.366 | -2.395 | -0.437 |
| -0.258999999999999 | -7.391 | -2.393 | -0.436 |
| -0.257999999999999 | -7.417 | -2.392 | -0.434 |
| -0.256999999999999 | -7.442 | -2.391 | -0.433 |
| -0.255999999999999 | -7.467 | -2.39 | -0.432 |
| -0.254999999999999 | -7.492 | -2.389 | -0.431 |
| -0.253999999999999 | -7.517 | -2.388 | -0.43 |
| -0.252999999999999 | -7.542 | -2.386 | -0.428 |
| -0.251999999999999 | -7.568 | -2.385 | -0.427 |
| -0.250999999999999 | -7.593 | -2.383 | -0.426 |
| -0.249999999999999 | -7.618 | -2.382 | -0.425 |
| -0.248999999999999 | -7.644 | -2.38 | -0.423 |
| -0.247999999999999 | -7.669 | -2.379 | -0.422 |
| -0.246999999999999 | -7.694 | -2.377 | -0.421 |
| -0.245999999999999 | -7.719 | -2.376 | -0.42 |
| -0.244999999999999 | -7.745 | -2.374 | -0.418 |
| -0.243999999999999 | -7.77 | -2.372 | -0.417 |
| -0.242999999999999 | -7.795 | -2.37 | -0.416 |
| -0.241999999999999 | -7.821 | -2.368 | -0.414 |
| -0.240999999999999 | -7.846 | -2.366 | -0.413 |
| -0.239999999999999 | -7.871 | -2.364 | -0.412 |
| -0.238999999999999 | -7.896 | -2.362 | -0.411 |
| -0.237999999999999 | -7.922 | -2.36 | -0.409 |
| -0.236999999999999 | -7.947 | -2.358 | -0.408 |
| -0.235999999999999 | -7.972 | -2.356 | -0.407 |
| -0.234999999999999 | -7.997 | -2.354 | -0.405 |
| -0.233999999999999 | -8.022 | -2.351 | -0.404 |
| -0.232999999999999 | -8.048 | -2.349 | -0.403 |
| -0.231999999999999 | -8.073 | -2.346 | -0.401 |
| -0.230999999999999 | -8.098 | -2.344 | -0.4 |
| -0.229999999999999 | -8.123 | -2.341 | -0.399 |
| -0.228999999999999 | -8.148 | -2.339 | -0.397 |
| -0.227999999999999 | -8.173 | -2.336 | -0.396 |
| -0.226999999999999 | -8.198 | -2.333 | -0.395 |
| -0.225999999999999 | -8.222 | -2.331 | -0.393 |
| -0.224999999999999 | -8.247 | -2.328 | -0.392 |
| -0.223999999999999 | -8.272 | -2.325 | -0.391 |
| -0.222999999999999 | -8.297 | -2.322 | -0.389 |
| -0.221999999999999 | -8.321 | -2.319 | -0.388 |
| -0.220999999999999 | -8.346 | -2.316 | -0.387 |
| -0.219999999999999 | -8.37 | -2.312 | -0.385 |
| -0.218999999999999 | -8.395 | -2.309 | -0.384 |
| -0.217999999999999 | -8.419 | -2.306 | -0.382 |
| -0.216999999999999 | -8.443 | -2.303 | -0.381 |
| -0.215999999999999 | -8.468 | -2.299 | -0.38 |
| -0.214999999999999 | -8.492 | -2.296 | -0.378 |
| -0.213999999999999 | -8.516 | -2.292 | -0.377 |
| -0.212999999999999 | -8.539 | -2.289 | -0.375 |
| -0.211999999999999 | -8.563 | -2.285 | -0.374 |
| -0.210999999999999 | -8.587 | -2.281 | -0.373 |
| -0.209999999999999 | -8.61 | -2.277 | -0.371 |
| -0.208999999999999 | -8.634 | -2.274 | -0.37 |
| -0.207999999999999 | -8.657 | -2.27 | -0.368 |
| -0.206999999999999 | -8.68 | -2.266 | -0.367 |
| -0.205999999999999 | -8.703 | -2.262 | -0.365 |
| -0.204999999999999 | -8.726 | -2.258 | -0.364 |
| -0.203999999999999 | -8.749 | -2.253 | -0.363 |
| -0.202999999999999 | -8.772 | -2.249 | -0.361 |
| -0.201999999999999 | -8.794 | -2.245 | -0.36 |
| -0.200999999999999 | -8.817 | -2.241 | -0.358 |
| -0.199999999999999 | -8.839 | -2.236 | -0.357 |
| -0.198999999999999 | -8.861 | -2.232 | -0.355 |
| -0.197999999999999 | -8.883 | -2.227 | -0.354 |
| -0.196999999999999 | -8.904 | -2.222 | -0.352 |
| -0.195999999999999 | -8.926 | -2.218 | -0.351 |
| -0.194999999999999 | -8.947 | -2.213 | -0.349 |
| -0.193999999999999 | -8.968 | -2.208 | -0.348 |
| -0.192999999999999 | -8.989 | -2.203 | -0.346 |
| -0.191999999999999 | -9.01 | -2.198 | -0.345 |
| -0.190999999999999 | -9.03 | -2.193 | -0.343 |
| -0.189999999999999 | -9.051 | -2.188 | -0.342 |
| -0.188999999999999 | -9.071 | -2.183 | -0.34 |
| -0.187999999999999 | -9.09 | -2.177 | -0.339 |
| -0.186999999999999 | -9.11 | -2.172 | -0.337 |
| -0.185999999999999 | -9.129 | -2.167 | -0.336 |
| -0.184999999999999 | -9.148 | -2.161 | -0.334 |
| -0.183999999999999 | -9.167 | -2.156 | -0.333 |
| -0.182999999999999 | -9.186 | -2.15 | -0.331 |
| -0.181999999999999 | -9.204 | -2.144 | -0.33 |
| -0.180999999999999 | -9.222 | -2.139 | -0.328 |
| -0.179999999999999 | -9.24 | -2.133 | -0.326 |
| -0.178999999999999 | -9.257 | -2.127 | -0.325 |
| -0.177999999999999 | -9.274 | -2.121 | -0.323 |
| -0.176999999999999 | -9.291 | -2.115 | -0.322 |
| -0.175999999999999 | -9.308 | -2.109 | -0.32 |
| -0.174999999999999 | -9.324 | -2.103 | -0.319 |
| -0.173999999999999 | -9.34 | -2.096 | -0.317 |
| -0.172999999999999 | -9.355 | -2.09 | -0.316 |
| -0.171999999999999 | -9.371 | -2.084 | -0.314 |
| -0.170999999999999 | -9.385 | -2.077 | -0.312 |
| -0.169999999999999 | -9.4 | -2.071 | -0.311 |
| -0.168999999999999 | -9.414 | -2.064 | -0.309 |
| -0.167999999999999 | -9.428 | -2.057 | -0.308 |
| -0.166999999999999 | -9.441 | -2.051 | -0.306 |
| -0.165999999999999 | -9.454 | -2.044 | -0.304 |
| -0.164999999999999 | -9.466 | -2.037 | -0.303 |
| -0.163999999999999 | -9.479 | -2.03 | -0.301 |
| -0.162999999999999 | -9.49 | -2.023 | -0.3 |
| -0.161999999999999 | -9.502 | -2.016 | -0.298 |
| -0.160999999999999 | -9.512 | -2.008 | -0.296 |
| -0.159999999999999 | -9.523 | -2.001 | -0.295 |
| -0.158999999999999 | -9.533 | -1.994 | -0.293 |
| -0.157999999999999 | -9.542 | -1.986 | -0.291 |
| -0.156999999999999 | -9.551 | -1.979 | -0.29 |
| -0.155999999999999 | -9.56 | -1.971 | -0.288 |
| -0.154999999999999 | -9.568 | -1.963 | -0.286 |
| -0.153999999999999 | -9.575 | -1.956 | -0.285 |
| -0.152999999999999 | -9.582 | -1.948 | -0.283 |
| -0.151999999999999 | -9.589 | -1.94 | -0.281 |
| -0.150999999999999 | -9.595 | -1.932 | -0.28 |
| -0.149999999999999 | -9.6 | -1.924 | -0.278 |
| -0.148999999999999 | -9.605 | -1.916 | -0.277 |
| -0.147999999999999 | -9.609 | -1.908 | -0.275 |
| -0.146999999999999 | -9.613 | -1.899 | -0.273 |
| -0.145999999999999 | -9.616 | -1.891 | -0.271 |
| -0.144999999999999 | -9.618 | -1.883 | -0.27 |
| -0.143999999999999 | -9.62 | -1.874 | -0.268 |
| -0.142999999999999 | -9.622 | -1.866 | -0.266 |
| -0.141999999999999 | -9.622 | -1.857 | -0.265 |
| -0.140999999999999 | -9.622 | -1.848 | -0.263 |
| -0.139999999999999 | -9.622 | -1.839 | -0.261 |
| -0.138999999999999 | -9.621 | -1.83 | -0.26 |
| -0.137999999999999 | -9.619 | -1.822 | -0.258 |
| -0.136999999999999 | -9.616 | -1.813 | -0.256 |
| -0.135999999999999 | -9.613 | -1.803 | -0.255 |
| -0.134999999999999 | -9.609 | -1.794 | -0.253 |
| -0.133999999999999 | -9.604 | -1.785 | -0.251 |
| -0.132999999999999 | -9.599 | -1.776 | -0.249 |
| -0.131999999999999 | -9.593 | -1.766 | -0.248 |
| -0.130999999999999 | -9.586 | -1.757 | -0.246 |
| -0.129999999999999 | -9.578 | -1.747 | -0.244 |
| -0.128999999999999 | -9.57 | -1.738 | -0.242 |
| -0.127999999999999 | -9.56 | -1.728 | -0.241 |
| -0.126999999999999 | -9.55 | -1.718 | -0.239 |
| -0.125999999999999 | -9.54 | -1.708 | -0.237 |
| -0.124999999999999 | -9.528 | -1.698 | -0.235 |
| -0.123999999999999 | -9.516 | -1.688 | -0.234 |
| -0.122999999999999 | -9.502 | -1.678 | -0.232 |
| -0.121999999999999 | -9.488 | -1.668 | -0.23 |
| -0.120999999999999 | -9.473 | -1.658 | -0.228 |
| -0.119999999999999 | -9.458 | -1.648 | -0.227 |
| -0.118999999999999 | -9.441 | -1.637 | -0.225 |
| -0.117999999999999 | -9.423 | -1.627 | -0.223 |
| -0.116999999999999 | -9.405 | -1.616 | -0.221 |
| -0.115999999999999 | -9.386 | -1.606 | -0.22 |
| -0.114999999999999 | -9.365 | -1.595 | -0.218 |
| -0.113999999999999 | -9.344 | -1.584 | -0.216 |
| -0.112999999999999 | -9.322 | -1.574 | -0.214 |
| -0.111999999999999 | -9.299 | -1.563 | -0.212 |
| -0.110999999999999 | -9.275 | -1.552 | -0.211 |
| -0.109999999999999 | -9.25 | -1.541 | -0.209 |
| -0.108999999999999 | -9.224 | -1.53 | -0.207 |
| -0.107999999999999 | -9.197 | -1.518 | -0.205 |
| -0.106999999999999 | -9.169 | -1.507 | -0.203 |
| -0.105999999999999 | -9.14 | -1.496 | -0.202 |
| -0.104999999999999 | -9.11 | -1.485 | -0.2 |
| -0.103999999999999 | -9.079 | -1.473 | -0.198 |
| -0.102999999999999 | -9.047 | -1.462 | -0.196 |
| -0.101999999999999 | -9.014 | -1.45 | -0.194 |
| -0.100999999999999 | -8.98 | -1.438 | -0.193 |
| -0.0999999999999992 | -8.944 | -1.427 | -0.191 |
| -0.0989999999999992 | -8.908 | -1.415 | -0.189 |
| -0.0979999999999992 | -8.871 | -1.403 | -0.187 |
| -0.0969999999999992 | -8.832 | -1.391 | -0.185 |
| -0.0959999999999992 | -8.792 | -1.379 | -0.184 |
| -0.0949999999999992 | -8.752 | -1.367 | -0.182 |
| -0.0939999999999992 | -8.71 | -1.355 | -0.18 |
| -0.0929999999999992 | -8.667 | -1.343 | -0.178 |
| -0.0919999999999992 | -8.623 | -1.331 | -0.176 |
| -0.0909999999999992 | -8.578 | -1.318 | -0.174 |
| -0.0899999999999992 | -8.531 | -1.306 | -0.172 |
| -0.0889999999999992 | -8.484 | -1.293 | -0.171 |
| -0.0879999999999992 | -8.435 | -1.281 | -0.169 |
| -0.0869999999999992 | -8.386 | -1.268 | -0.167 |
| -0.0859999999999992 | -8.335 | -1.256 | -0.165 |
| -0.0849999999999992 | -8.282 | -1.243 | -0.163 |
| -0.0839999999999992 | -8.229 | -1.23 | -0.161 |
| -0.0829999999999992 | -8.175 | -1.217 | -0.16 |
| -0.0819999999999992 | -8.119 | -1.205 | -0.158 |
| -0.0809999999999992 | -8.062 | -1.192 | -0.156 |
| -0.0799999999999992 | -8.004 | -1.179 | -0.154 |
| -0.0789999999999992 | -7.945 | -1.166 | -0.152 |
| -0.0779999999999992 | -7.884 | -1.152 | -0.15 |
| -0.0769999999999992 | -7.823 | -1.139 | -0.148 |
| -0.0759999999999992 | -7.76 | -1.126 | -0.146 |
| -0.0749999999999992 | -7.696 | -1.113 | -0.145 |
| -0.0739999999999992 | -7.631 | -1.099 | -0.143 |
| -0.0729999999999992 | -7.564 | -1.086 | -0.141 |
| -0.0719999999999992 | -7.496 | -1.072 | -0.139 |
| -0.0709999999999992 | -7.428 | -1.059 | -0.137 |
| -0.0699999999999992 | -7.357 | -1.045 | -0.135 |
| -0.0689999999999992 | -7.286 | -1.032 | -0.133 |
| -0.0679999999999992 | -7.214 | -1.018 | -0.131 |
| -0.0669999999999992 | -7.14 | -1.004 | -0.129 |
| -0.0659999999999992 | -7.065 | -0.991 | -0.128 |
| -0.0649999999999992 | -6.989 | -0.977 | -0.126 |
| -0.0639999999999992 | -6.912 | -0.963 | -0.124 |
| -0.0629999999999992 | -6.833 | -0.949 | -0.122 |
| -0.0619999999999992 | -6.753 | -0.935 | -0.12 |
| -0.0609999999999992 | -6.673 | -0.921 | -0.118 |
| -0.0599999999999992 | -6.591 | -0.907 | -0.116 |
| -0.0589999999999992 | -6.507 | -0.893 | -0.114 |
| -0.0579999999999992 | -6.423 | -0.878 | -0.112 |
| -0.0569999999999992 | -6.337 | -0.864 | -0.11 |
| -0.0559999999999992 | -6.251 | -0.85 | -0.109 |
| -0.0549999999999991 | -6.163 | -0.836 | -0.107 |
| -0.0539999999999991 | -6.074 | -0.821 | -0.105 |
| -0.0529999999999991 | -5.984 | -0.807 | -0.103 |
| -0.0519999999999991 | -5.893 | -0.792 | -0.101 |
| -0.0509999999999991 | -5.8 | -0.778 | -0.099 |
| -0.0499999999999991 | -5.707 | -0.763 | -0.097 |
| -0.0489999999999991 | -5.612 | -0.749 | -0.095 |
| -0.0479999999999991 | -5.517 | -0.734 | -0.093 |
| -0.0469999999999991 | -5.42 | -0.719 | -0.091 |
| -0.0459999999999991 | -5.322 | -0.705 | -0.089 |
| -0.0449999999999991 | -5.223 | -0.69 | -0.087 |
| -0.0439999999999991 | -5.124 | -0.675 | -0.086 |
| -0.0429999999999991 | -5.023 | -0.66 | -0.084 |
| -0.0419999999999991 | -4.921 | -0.646 | -0.082 |
| -0.0409999999999991 | -4.818 | -0.631 | -0.08 |
| -0.0399999999999991 | -4.714 | -0.616 | -0.078 |
| -0.0389999999999991 | -4.61 | -0.601 | -0.076 |
| -0.0379999999999991 | -4.504 | -0.586 | -0.074 |
| -0.0369999999999991 | -4.397 | -0.571 | -0.072 |
| -0.0359999999999991 | -4.29 | -0.556 | -0.07 |
| -0.0349999999999991 | -4.181 | -0.541 | -0.068 |
| -0.0339999999999991 | -4.072 | -0.526 | -0.066 |
| -0.0329999999999991 | -3.962 | -0.51 | -0.064 |
| -0.0319999999999991 | -3.851 | -0.495 | -0.062 |
| -0.0309999999999991 | -3.739 | -0.48 | -0.06 |
| -0.0299999999999991 | -3.627 | -0.465 | -0.058 |
| -0.0289999999999991 | -3.514 | -0.45 | -0.057 |
| -0.0279999999999991 | -3.4 | -0.434 | -0.055 |
| -0.0269999999999991 | -3.285 | -0.419 | -0.053 |
| -0.0259999999999991 | -3.169 | -0.404 | -0.051 |
| -0.0249999999999991 | -3.053 | -0.388 | -0.049 |
| -0.0239999999999991 | -2.936 | -0.373 | -0.047 |
| -0.0229999999999991 | -2.819 | -0.358 | -0.045 |
| -0.0219999999999991 | -2.701 | -0.342 | -0.043 |
| -0.0209999999999991 | -2.582 | -0.327 | -0.041 |
| -0.0199999999999991 | -2.463 | -0.311 | -0.039 |
| -0.0189999999999991 | -2.343 | -0.296 | -0.037 |
| -0.0179999999999991 | -2.223 | -0.28 | -0.035 |
| -0.0169999999999991 | -2.102 | -0.265 | -0.033 |
| -0.0159999999999991 | -1.981 | -0.249 | -0.031 |
| -0.0149999999999991 | -1.859 | -0.234 | -0.029 |
| -0.0139999999999991 | -1.737 | -0.218 | -0.027 |
| -0.0129999999999991 | -1.615 | -0.203 | -0.025 |
| -0.0119999999999991 | -1.492 | -0.187 | -0.023 |
| -0.0109999999999991 | -1.369 | -0.172 | -0.021 |
| -0.00999999999999912 | -1.245 | -0.156 | -0.02 |
| -0.00899999999999912 | -1.122 | -0.141 | -0.018 |
| -0.00799999999999912 | -0.998 | -0.125 | -0.016 |
| -0.00699999999999912 | -0.873 | -0.109 | -0.014 |
| -0.00599999999999912 | -0.749 | -0.094 | -0.012 |
| -0.00499999999999912 | -0.624 | -0.078 | -0.01 |
| -0.00399999999999912 | -0.5 | -0.062 | -0.008 |
| -0.00299999999999912 | -0.375 | -0.047 | -0.006 |
| -0.00199999999999912 | -0.25 | -0.031 | -0.004 |
| -0.000999999999999118 | -0.125 | -0.016 | -0.002 |
| 8.81239525796218e-16 | 0 | 0 | 0 |
| 0.00100000000000088 | 0.125 | 0.016 | 0.002 |
| 0.00200000000000088 | 0.25 | 0.031 | 0.004 |
| 0.00300000000000088 | 0.375 | 0.047 | 0.006 |
| 0.00400000000000088 | 0.5 | 0.062 | 0.008 |
| 0.00500000000000088 | 0.624 | 0.078 | 0.01 |
| 0.00600000000000088 | 0.749 | 0.094 | 0.012 |
| 0.00700000000000088 | 0.873 | 0.109 | 0.014 |
| 0.00800000000000088 | 0.998 | 0.125 | 0.016 |
| 0.00900000000000088 | 1.122 | 0.141 | 0.018 |
| 0.0100000000000009 | 1.245 | 0.156 | 0.02 |
| 0.0110000000000009 | 1.369 | 0.172 | 0.021 |
| 0.0120000000000009 | 1.492 | 0.187 | 0.023 |
| 0.0130000000000009 | 1.615 | 0.203 | 0.025 |
| 0.0140000000000009 | 1.737 | 0.218 | 0.027 |
| 0.0150000000000009 | 1.859 | 0.234 | 0.029 |
| 0.0160000000000009 | 1.981 | 0.249 | 0.031 |
| 0.0170000000000009 | 2.102 | 0.265 | 0.033 |
| 0.0180000000000009 | 2.223 | 0.28 | 0.035 |
| 0.0190000000000009 | 2.343 | 0.296 | 0.037 |
| 0.0200000000000009 | 2.463 | 0.311 | 0.039 |
| 0.0210000000000009 | 2.582 | 0.327 | 0.041 |
| 0.0220000000000009 | 2.701 | 0.342 | 0.043 |
| 0.0230000000000009 | 2.819 | 0.358 | 0.045 |
| 0.0240000000000009 | 2.936 | 0.373 | 0.047 |
| 0.0250000000000009 | 3.053 | 0.388 | 0.049 |
| 0.0260000000000009 | 3.169 | 0.404 | 0.051 |
| 0.0270000000000009 | 3.285 | 0.419 | 0.053 |
| 0.0280000000000009 | 3.4 | 0.434 | 0.055 |
| 0.0290000000000009 | 3.514 | 0.45 | 0.057 |
| 0.0300000000000009 | 3.627 | 0.465 | 0.058 |
| 0.0310000000000009 | 3.739 | 0.48 | 0.06 |
| 0.0320000000000009 | 3.851 | 0.495 | 0.062 |
| 0.0330000000000009 | 3.962 | 0.51 | 0.064 |
| 0.0340000000000009 | 4.072 | 0.526 | 0.066 |
| 0.0350000000000009 | 4.181 | 0.541 | 0.068 |
| 0.0360000000000009 | 4.29 | 0.556 | 0.07 |
| 0.0370000000000009 | 4.397 | 0.571 | 0.072 |
| 0.0380000000000009 | 4.504 | 0.586 | 0.074 |
| 0.0390000000000009 | 4.61 | 0.601 | 0.076 |
| 0.0400000000000009 | 4.714 | 0.616 | 0.078 |
| 0.0410000000000009 | 4.818 | 0.631 | 0.08 |
| 0.0420000000000009 | 4.921 | 0.646 | 0.082 |
| 0.0430000000000009 | 5.023 | 0.66 | 0.084 |
| 0.0440000000000009 | 5.124 | 0.675 | 0.086 |
| 0.0450000000000009 | 5.223 | 0.69 | 0.087 |
| 0.0460000000000009 | 5.322 | 0.705 | 0.089 |
| 0.0470000000000009 | 5.42 | 0.719 | 0.091 |
| 0.0480000000000009 | 5.517 | 0.734 | 0.093 |
| 0.0490000000000009 | 5.612 | 0.749 | 0.095 |
| 0.0500000000000009 | 5.707 | 0.763 | 0.097 |
| 0.0510000000000009 | 5.8 | 0.778 | 0.099 |
| 0.0520000000000009 | 5.893 | 0.792 | 0.101 |
| 0.0530000000000009 | 5.984 | 0.807 | 0.103 |
| 0.0540000000000009 | 6.074 | 0.821 | 0.105 |
| 0.0550000000000009 | 6.163 | 0.836 | 0.107 |
| 0.0560000000000009 | 6.251 | 0.85 | 0.109 |
| 0.0570000000000009 | 6.337 | 0.864 | 0.11 |
| 0.0580000000000009 | 6.423 | 0.878 | 0.112 |
| 0.0590000000000009 | 6.507 | 0.893 | 0.114 |
| 0.0600000000000009 | 6.591 | 0.907 | 0.116 |
| 0.0610000000000009 | 6.673 | 0.921 | 0.118 |
| 0.0620000000000009 | 6.753 | 0.935 | 0.12 |
| 0.0630000000000009 | 6.833 | 0.949 | 0.122 |
| 0.0640000000000009 | 6.912 | 0.963 | 0.124 |
| 0.0650000000000009 | 6.989 | 0.977 | 0.126 |
| 0.0660000000000009 | 7.065 | 0.991 | 0.128 |
| 0.0670000000000009 | 7.14 | 1.004 | 0.129 |
| 0.0680000000000009 | 7.214 | 1.018 | 0.131 |
| 0.0690000000000009 | 7.286 | 1.032 | 0.133 |
| 0.0700000000000009 | 7.357 | 1.045 | 0.135 |
| 0.0710000000000009 | 7.428 | 1.059 | 0.137 |
| 0.0720000000000009 | 7.496 | 1.072 | 0.139 |
| 0.0730000000000009 | 7.564 | 1.086 | 0.141 |
| 0.0740000000000009 | 7.631 | 1.099 | 0.143 |
| 0.0750000000000009 | 7.696 | 1.113 | 0.145 |
| 0.0760000000000009 | 7.76 | 1.126 | 0.146 |
| 0.0770000000000009 | 7.823 | 1.139 | 0.148 |
| 0.0780000000000009 | 7.884 | 1.152 | 0.15 |
| 0.0790000000000009 | 7.945 | 1.166 | 0.152 |
| 0.0800000000000009 | 8.004 | 1.179 | 0.154 |
| 0.0810000000000009 | 8.062 | 1.192 | 0.156 |
| 0.0820000000000009 | 8.119 | 1.205 | 0.158 |
| 0.0830000000000009 | 8.175 | 1.217 | 0.16 |
| 0.0840000000000009 | 8.229 | 1.23 | 0.161 |
| 0.0850000000000009 | 8.282 | 1.243 | 0.163 |
| 0.0860000000000009 | 8.335 | 1.256 | 0.165 |
| 0.0870000000000009 | 8.386 | 1.268 | 0.167 |
| 0.0880000000000009 | 8.435 | 1.281 | 0.169 |
| 0.0890000000000009 | 8.484 | 1.293 | 0.171 |
| 0.0900000000000009 | 8.531 | 1.306 | 0.172 |
| 0.0910000000000009 | 8.578 | 1.318 | 0.174 |
| 0.0920000000000009 | 8.623 | 1.331 | 0.176 |
| 0.0930000000000009 | 8.667 | 1.343 | 0.178 |
| 0.0940000000000009 | 8.71 | 1.355 | 0.18 |
| 0.0950000000000009 | 8.752 | 1.367 | 0.182 |
| 0.0960000000000009 | 8.792 | 1.379 | 0.184 |
| 0.0970000000000009 | 8.832 | 1.391 | 0.185 |
| 0.0980000000000009 | 8.871 | 1.403 | 0.187 |
| 0.0990000000000009 | 8.908 | 1.415 | 0.189 |
| 0.100000000000001 | 8.944 | 1.427 | 0.191 |
| 0.101000000000001 | 8.98 | 1.438 | 0.193 |
| 0.102000000000001 | 9.014 | 1.45 | 0.194 |
| 0.103000000000001 | 9.047 | 1.462 | 0.196 |
| 0.104000000000001 | 9.079 | 1.473 | 0.198 |
| 0.105000000000001 | 9.11 | 1.485 | 0.2 |
| 0.106000000000001 | 9.14 | 1.496 | 0.202 |
| 0.107000000000001 | 9.169 | 1.507 | 0.203 |
| 0.108000000000001 | 9.197 | 1.518 | 0.205 |
| 0.109000000000001 | 9.224 | 1.53 | 0.207 |
| 0.110000000000001 | 9.25 | 1.541 | 0.209 |
| 0.111000000000001 | 9.275 | 1.552 | 0.211 |
| 0.112000000000001 | 9.299 | 1.563 | 0.212 |
| 0.113000000000001 | 9.322 | 1.574 | 0.214 |
| 0.114000000000001 | 9.344 | 1.584 | 0.216 |
| 0.115000000000001 | 9.365 | 1.595 | 0.218 |
| 0.116000000000001 | 9.386 | 1.606 | 0.22 |
| 0.117000000000001 | 9.405 | 1.616 | 0.221 |
| 0.118000000000001 | 9.423 | 1.627 | 0.223 |
| 0.119000000000001 | 9.441 | 1.637 | 0.225 |
| 0.120000000000001 | 9.458 | 1.648 | 0.227 |
| 0.121000000000001 | 9.473 | 1.658 | 0.228 |
| 0.122000000000001 | 9.488 | 1.668 | 0.23 |
| 0.123000000000001 | 9.502 | 1.678 | 0.232 |
| 0.124000000000001 | 9.516 | 1.688 | 0.234 |
| 0.125000000000001 | 9.528 | 1.698 | 0.235 |
| 0.126000000000001 | 9.54 | 1.708 | 0.237 |
| 0.127000000000001 | 9.55 | 1.718 | 0.239 |
| 0.128000000000001 | 9.56 | 1.728 | 0.241 |
| 0.129000000000001 | 9.57 | 1.738 | 0.242 |
| 0.130000000000001 | 9.578 | 1.747 | 0.244 |
| 0.131000000000001 | 9.586 | 1.757 | 0.246 |
| 0.132000000000001 | 9.593 | 1.766 | 0.248 |
| 0.133000000000001 | 9.599 | 1.776 | 0.249 |
| 0.134000000000001 | 9.604 | 1.785 | 0.251 |
| 0.135000000000001 | 9.609 | 1.794 | 0.253 |
| 0.136000000000001 | 9.613 | 1.803 | 0.255 |
| 0.137000000000001 | 9.616 | 1.813 | 0.256 |
| 0.138000000000001 | 9.619 | 1.822 | 0.258 |
| 0.139000000000001 | 9.621 | 1.83 | 0.26 |
| 0.140000000000001 | 9.622 | 1.839 | 0.261 |
| 0.141000000000001 | 9.622 | 1.848 | 0.263 |
| 0.142000000000001 | 9.622 | 1.857 | 0.265 |
| 0.143000000000001 | 9.622 | 1.866 | 0.266 |
| 0.144000000000001 | 9.62 | 1.874 | 0.268 |
| 0.145000000000001 | 9.618 | 1.883 | 0.27 |
| 0.146000000000001 | 9.616 | 1.891 | 0.271 |
| 0.147000000000001 | 9.613 | 1.899 | 0.273 |
| 0.148000000000001 | 9.609 | 1.908 | 0.275 |
| 0.149000000000001 | 9.605 | 1.916 | 0.277 |
| 0.150000000000001 | 9.6 | 1.924 | 0.278 |
| 0.151000000000001 | 9.595 | 1.932 | 0.28 |
| 0.152000000000001 | 9.589 | 1.94 | 0.281 |
| 0.153000000000001 | 9.582 | 1.948 | 0.283 |
| 0.154000000000001 | 9.575 | 1.956 | 0.285 |
| 0.155000000000001 | 9.568 | 1.963 | 0.286 |
| 0.156000000000001 | 9.56 | 1.971 | 0.288 |
| 0.157000000000001 | 9.551 | 1.979 | 0.29 |
| 0.158000000000001 | 9.542 | 1.986 | 0.291 |
| 0.159000000000001 | 9.533 | 1.994 | 0.293 |
| 0.160000000000001 | 9.523 | 2.001 | 0.295 |
| 0.161000000000001 | 9.512 | 2.008 | 0.296 |
| 0.162000000000001 | 9.502 | 2.016 | 0.298 |
| 0.163000000000001 | 9.49 | 2.023 | 0.3 |
| 0.164000000000001 | 9.479 | 2.03 | 0.301 |
| 0.165000000000001 | 9.466 | 2.037 | 0.303 |
| 0.166000000000001 | 9.454 | 2.044 | 0.304 |
| 0.167000000000001 | 9.441 | 2.051 | 0.306 |
| 0.168000000000001 | 9.428 | 2.057 | 0.308 |
| 0.169000000000001 | 9.414 | 2.064 | 0.309 |
| 0.170000000000001 | 9.4 | 2.071 | 0.311 |
| 0.171000000000001 | 9.385 | 2.077 | 0.312 |
| 0.172000000000001 | 9.371 | 2.084 | 0.314 |
| 0.173000000000001 | 9.355 | 2.09 | 0.316 |
| 0.174000000000001 | 9.34 | 2.096 | 0.317 |
| 0.175000000000001 | 9.324 | 2.103 | 0.319 |
| 0.176000000000001 | 9.308 | 2.109 | 0.32 |
| 0.177000000000001 | 9.291 | 2.115 | 0.322 |
| 0.178000000000001 | 9.274 | 2.121 | 0.323 |
| 0.179000000000001 | 9.257 | 2.127 | 0.325 |
| 0.180000000000001 | 9.24 | 2.133 | 0.326 |
| 0.181000000000001 | 9.222 | 2.139 | 0.328 |
| 0.182000000000001 | 9.204 | 2.144 | 0.33 |
| 0.183000000000001 | 9.186 | 2.15 | 0.331 |
| 0.184000000000001 | 9.167 | 2.156 | 0.333 |
| 0.185000000000001 | 9.148 | 2.161 | 0.334 |
| 0.186000000000001 | 9.129 | 2.167 | 0.336 |
| 0.187000000000001 | 9.11 | 2.172 | 0.337 |
| 0.188000000000001 | 9.09 | 2.177 | 0.339 |
| 0.189000000000001 | 9.071 | 2.183 | 0.34 |
| 0.190000000000001 | 9.051 | 2.188 | 0.342 |
| 0.191000000000001 | 9.03 | 2.193 | 0.343 |
| 0.192000000000001 | 9.01 | 2.198 | 0.345 |
| 0.193000000000001 | 8.989 | 2.203 | 0.346 |
| 0.194000000000001 | 8.968 | 2.208 | 0.348 |
| 0.195000000000001 | 8.947 | 2.213 | 0.349 |
| 0.196000000000001 | 8.926 | 2.218 | 0.351 |
| 0.197000000000001 | 8.904 | 2.222 | 0.352 |
| 0.198000000000001 | 8.883 | 2.227 | 0.354 |
| 0.199000000000001 | 8.861 | 2.232 | 0.355 |
| 0.200000000000001 | 8.839 | 2.236 | 0.357 |
| 0.201000000000001 | 8.817 | 2.241 | 0.358 |
| 0.202000000000001 | 8.794 | 2.245 | 0.36 |
| 0.203000000000001 | 8.772 | 2.249 | 0.361 |
| 0.204000000000001 | 8.749 | 2.253 | 0.363 |
| 0.205000000000001 | 8.726 | 2.258 | 0.364 |
| 0.206000000000001 | 8.703 | 2.262 | 0.365 |
| 0.207000000000001 | 8.68 | 2.266 | 0.367 |
| 0.208000000000001 | 8.657 | 2.27 | 0.368 |
| 0.209000000000001 | 8.634 | 2.274 | 0.37 |
| 0.210000000000001 | 8.61 | 2.277 | 0.371 |
| 0.211000000000001 | 8.587 | 2.281 | 0.373 |
| 0.212000000000001 | 8.563 | 2.285 | 0.374 |
| 0.213000000000001 | 8.539 | 2.289 | 0.375 |
| 0.214000000000001 | 8.516 | 2.292 | 0.377 |
| 0.215000000000001 | 8.492 | 2.296 | 0.378 |
| 0.216000000000001 | 8.468 | 2.299 | 0.38 |
| 0.217000000000001 | 8.443 | 2.303 | 0.381 |
| 0.218000000000001 | 8.419 | 2.306 | 0.382 |
| 0.219000000000001 | 8.395 | 2.309 | 0.384 |
| 0.220000000000001 | 8.37 | 2.312 | 0.385 |
| 0.221000000000001 | 8.346 | 2.316 | 0.387 |
| 0.222000000000001 | 8.321 | 2.319 | 0.388 |
| 0.223000000000001 | 8.297 | 2.322 | 0.389 |
| 0.224000000000001 | 8.272 | 2.325 | 0.391 |
| 0.225000000000001 | 8.247 | 2.328 | 0.392 |
| 0.226000000000001 | 8.222 | 2.331 | 0.393 |
| 0.227000000000001 | 8.198 | 2.333 | 0.395 |
| 0.228000000000001 | 8.173 | 2.336 | 0.396 |
| 0.229000000000001 | 8.148 | 2.339 | 0.397 |
| 0.230000000000001 | 8.123 | 2.341 | 0.399 |
| 0.231000000000001 | 8.098 | 2.344 | 0.4 |
| 0.232000000000001 | 8.073 | 2.346 | 0.401 |
| 0.233000000000001 | 8.048 | 2.349 | 0.403 |
| 0.234000000000001 | 8.022 | 2.351 | 0.404 |
| 0.235000000000001 | 7.997 | 2.354 | 0.405 |
| 0.236000000000001 | 7.972 | 2.356 | 0.407 |
| 0.237000000000001 | 7.947 | 2.358 | 0.408 |
| 0.238000000000001 | 7.922 | 2.36 | 0.409 |
| 0.239000000000001 | 7.896 | 2.362 | 0.411 |
| 0.240000000000001 | 7.871 | 2.364 | 0.412 |
| 0.241000000000001 | 7.846 | 2.366 | 0.413 |
| 0.242000000000001 | 7.821 | 2.368 | 0.414 |
| 0.243000000000001 | 7.795 | 2.37 | 0.416 |
| 0.244000000000001 | 7.77 | 2.372 | 0.417 |
| 0.245000000000001 | 7.745 | 2.374 | 0.418 |
| 0.246000000000001 | 7.719 | 2.376 | 0.42 |
| 0.247000000000001 | 7.694 | 2.377 | 0.421 |
| 0.248000000000001 | 7.669 | 2.379 | 0.422 |
| 0.249000000000001 | 7.644 | 2.38 | 0.423 |
| 0.250000000000001 | 7.618 | 2.382 | 0.425 |
| 0.251000000000001 | 7.593 | 2.383 | 0.426 |
| 0.252000000000001 | 7.568 | 2.385 | 0.427 |
| 0.253000000000001 | 7.542 | 2.386 | 0.428 |
| 0.254000000000001 | 7.517 | 2.388 | 0.43 |
| 0.255000000000001 | 7.492 | 2.389 | 0.431 |
| 0.256000000000001 | 7.467 | 2.39 | 0.432 |
| 0.257000000000001 | 7.442 | 2.391 | 0.433 |
| 0.258000000000001 | 7.417 | 2.392 | 0.434 |
| 0.259000000000001 | 7.391 | 2.393 | 0.436 |
| 0.260000000000001 | 7.366 | 2.395 | 0.437 |
| 0.261000000000001 | 7.341 | 2.395 | 0.438 |
| 0.262000000000001 | 7.316 | 2.396 | 0.439 |
| 0.263000000000001 | 7.291 | 2.397 | 0.44 |
| 0.264000000000001 | 7.266 | 2.398 | 0.442 |
| 0.265000000000001 | 7.241 | 2.399 | 0.443 |
| 0.266000000000001 | 7.217 | 2.4 | 0.444 |
| 0.267000000000001 | 7.192 | 2.4 | 0.445 |
| 0.268000000000001 | 7.167 | 2.401 | 0.446 |
| 0.269000000000001 | 7.142 | 2.402 | 0.447 |
| 0.270000000000001 | 7.117 | 2.402 | 0.449 |
| 0.271000000000001 | 7.093 | 2.403 | 0.45 |
| 0.272000000000001 | 7.068 | 2.403 | 0.451 |
| 0.273000000000001 | 7.044 | 2.404 | 0.452 |
| 0.274000000000001 | 7.019 | 2.404 | 0.453 |
| 0.275000000000001 | 6.994 | 2.404 | 0.454 |
| 0.276000000000001 | 6.97 | 2.405 | 0.455 |
| 0.277000000000001 | 6.946 | 2.405 | 0.457 |
| 0.278000000000001 | 6.921 | 2.405 | 0.458 |
| 0.279000000000001 | 6.897 | 2.405 | 0.459 |
| 0.280000000000001 | 6.873 | 2.405 | 0.46 |
| 0.281000000000001 | 6.849 | 2.406 | 0.461 |
| 0.282000000000001 | 6.824 | 2.406 | 0.462 |
| 0.283000000000001 | 6.8 | 2.406 | 0.463 |
| 0.284000000000001 | 6.776 | 2.406 | 0.464 |
| 0.285000000000001 | 6.752 | 2.406 | 0.465 |
| 0.286000000000001 | 6.728 | 2.405 | 0.466 |
| 0.287000000000001 | 6.705 | 2.405 | 0.467 |
| 0.288000000000001 | 6.681 | 2.405 | 0.469 |
| 0.289000000000001 | 6.657 | 2.405 | 0.47 |
| 0.290000000000001 | 6.633 | 2.405 | 0.471 |
| 0.291000000000001 | 6.61 | 2.404 | 0.472 |
| 0.292000000000001 | 6.586 | 2.404 | 0.473 |
| 0.293000000000001 | 6.563 | 2.404 | 0.474 |
| 0.294000000000001 | 6.539 | 2.403 | 0.475 |
| 0.295000000000001 | 6.516 | 2.403 | 0.476 |
| 0.296000000000001 | 6.493 | 2.402 | 0.477 |
| 0.297000000000001 | 6.47 | 2.402 | 0.478 |
| 0.298000000000001 | 6.446 | 2.401 | 0.479 |
| 0.299000000000001 | 6.423 | 2.401 | 0.48 |
| 0.300000000000001 | 6.4 | 2.4 | 0.481 |
| 0.301000000000001 | 6.377 | 2.399 | 0.482 |
| 0.302000000000001 | 6.355 | 2.399 | 0.483 |
| 0.303000000000001 | 6.332 | 2.398 | 0.484 |
| 0.304000000000001 | 6.309 | 2.397 | 0.485 |
| 0.305000000000001 | 6.286 | 2.396 | 0.486 |
| 0.306000000000001 | 6.264 | 2.396 | 0.487 |
| 0.307000000000001 | 6.241 | 2.395 | 0.488 |
| 0.308000000000001 | 6.219 | 2.394 | 0.489 |
| 0.309000000000001 | 6.196 | 2.393 | 0.49 |
| 0.310000000000001 | 6.174 | 2.392 | 0.491 |
| 0.311000000000001 | 6.152 | 2.391 | 0.492 |
| 0.312000000000001 | 6.13 | 2.39 | 0.493 |
| 0.313000000000001 | 6.108 | 2.389 | 0.494 |
| 0.314000000000001 | 6.086 | 2.388 | 0.495 |
| 0.315000000000001 | 6.064 | 2.387 | 0.496 |
| 0.316000000000001 | 6.042 | 2.386 | 0.497 |
| 0.317000000000001 | 6.02 | 2.384 | 0.497 |
| 0.318000000000001 | 5.998 | 2.383 | 0.498 |
| 0.319000000000001 | 5.977 | 2.382 | 0.499 |
| 0.320000000000001 | 5.955 | 2.381 | 0.5 |
| 0.321000000000001 | 5.934 | 2.379 | 0.501 |
| 0.322000000000001 | 5.912 | 2.378 | 0.502 |
| 0.323000000000001 | 5.891 | 2.377 | 0.503 |
| 0.324000000000001 | 5.869 | 2.375 | 0.504 |
| 0.325000000000001 | 5.848 | 2.374 | 0.505 |
| 0.326000000000001 | 5.827 | 2.373 | 0.506 |
| 0.327000000000001 | 5.806 | 2.371 | 0.507 |
| 0.328000000000001 | 5.785 | 2.37 | 0.507 |
| 0.329000000000001 | 5.764 | 2.368 | 0.508 |
| 0.330000000000001 | 5.743 | 2.367 | 0.509 |
| 0.331000000000001 | 5.723 | 2.365 | 0.51 |
| 0.332000000000001 | 5.702 | 2.363 | 0.511 |
| 0.333000000000001 | 5.681 | 2.362 | 0.512 |
| 0.334000000000001 | 5.661 | 2.36 | 0.513 |
| 0.335000000000001 | 5.64 | 2.359 | 0.513 |
| 0.336000000000001 | 5.62 | 2.357 | 0.514 |
| 0.337000000000001 | 5.6 | 2.355 | 0.515 |
| 0.338000000000001 | 5.58 | 2.353 | 0.516 |
| 0.339000000000001 | 5.559 | 2.352 | 0.517 |
| 0.340000000000001 | 5.539 | 2.35 | 0.518 |
| 0.341000000000001 | 5.519 | 2.348 | 0.518 |
| 0.342000000000001 | 5.5 | 2.346 | 0.519 |
| 0.343000000000001 | 5.48 | 2.344 | 0.52 |
| 0.344000000000001 | 5.46 | 2.343 | 0.521 |
| 0.345000000000001 | 5.44 | 2.341 | 0.522 |
| 0.346000000000001 | 5.421 | 2.339 | 0.523 |
| 0.347000000000001 | 5.401 | 2.337 | 0.523 |
| 0.348000000000001 | 5.382 | 2.335 | 0.524 |
| 0.349000000000001 | 5.362 | 2.333 | 0.525 |
| 0.350000000000001 | 5.343 | 2.331 | 0.526 |
| 0.351000000000001 | 5.324 | 2.329 | 0.526 |
| 0.352000000000001 | 5.305 | 2.327 | 0.527 |
| 0.353000000000001 | 5.286 | 2.325 | 0.528 |
| 0.354000000000001 | 5.267 | 2.323 | 0.529 |
| 0.355000000000001 | 5.248 | 2.321 | 0.529 |
| 0.356000000000001 | 5.229 | 2.319 | 0.53 |
| 0.357000000000001 | 5.21 | 2.316 | 0.531 |
| 0.358000000000001 | 5.191 | 2.314 | 0.532 |
| 0.359000000000001 | 5.173 | 2.312 | 0.532 |
| 0.360000000000001 | 5.154 | 2.31 | 0.533 |
| 0.361000000000001 | 5.136 | 2.308 | 0.534 |
| 0.362000000000001 | 5.117 | 2.306 | 0.535 |
| 0.363000000000001 | 5.099 | 2.303 | 0.535 |
| 0.364000000000001 | 5.081 | 2.301 | 0.536 |
| 0.365000000000001 | 5.063 | 2.299 | 0.537 |
| 0.366000000000001 | 5.045 | 2.296 | 0.538 |
| 0.367000000000001 | 5.027 | 2.294 | 0.538 |
| 0.368000000000001 | 5.009 | 2.292 | 0.539 |
| 0.369000000000001 | 4.991 | 2.289 | 0.54 |
| 0.370000000000001 | 4.973 | 2.287 | 0.54 |
| 0.371000000000001 | 4.955 | 2.285 | 0.541 |
| 0.372000000000001 | 4.938 | 2.282 | 0.542 |
| 0.373000000000001 | 4.92 | 2.28 | 0.542 |
| 0.374000000000001 | 4.902 | 2.278 | 0.543 |
| 0.375000000000001 | 4.885 | 2.275 | 0.544 |
| 0.376000000000001 | 4.868 | 2.273 | 0.544 |
| 0.377000000000001 | 4.85 | 2.27 | 0.545 |
| 0.378000000000001 | 4.833 | 2.268 | 0.546 |
| 0.379000000000001 | 4.816 | 2.265 | 0.546 |
| 0.380000000000001 | 4.799 | 2.263 | 0.547 |
| 0.381000000000001 | 4.782 | 2.26 | 0.548 |
| 0.382000000000001 | 4.765 | 2.258 | 0.548 |
| 0.383000000000001 | 4.748 | 2.255 | 0.549 |
| 0.384000000000001 | 4.731 | 2.252 | 0.55 |
| 0.385000000000001 | 4.715 | 2.25 | 0.55 |
| 0.386000000000001 | 4.698 | 2.247 | 0.551 |
| 0.387000000000001 | 4.681 | 2.245 | 0.551 |
| 0.388000000000001 | 4.665 | 2.242 | 0.552 |
| 0.389000000000001 | 4.648 | 2.239 | 0.553 |
| 0.390000000000001 | 4.632 | 2.237 | 0.553 |
| 0.391000000000001 | 4.616 | 2.234 | 0.554 |
| 0.392000000000001 | 4.6 | 2.231 | 0.554 |
| 0.393000000000001 | 4.583 | 2.229 | 0.555 |
| 0.394000000000001 | 4.567 | 2.226 | 0.556 |
| 0.395000000000001 | 4.551 | 2.223 | 0.556 |
| 0.396000000000001 | 4.535 | 2.221 | 0.557 |
| 0.397000000000001 | 4.519 | 2.218 | 0.557 |
| 0.398000000000001 | 4.504 | 2.215 | 0.558 |
| 0.399000000000001 | 4.488 | 2.212 | 0.558 |
| 0.400000000000001 | 4.472 | 2.21 | 0.559 |
| 0.401000000000001 | 4.457 | 2.207 | 0.56 |
| 0.402000000000001 | 4.441 | 2.204 | 0.56 |
| 0.403000000000001 | 4.425 | 2.201 | 0.561 |
| 0.404000000000001 | 4.41 | 2.199 | 0.561 |
| 0.405000000000001 | 4.395 | 2.196 | 0.562 |
| 0.406000000000001 | 4.379 | 2.193 | 0.562 |
| 0.407000000000001 | 4.364 | 2.19 | 0.563 |
| 0.408000000000001 | 4.349 | 2.187 | 0.563 |
| 0.409000000000001 | 4.334 | 2.184 | 0.564 |
| 0.410000000000001 | 4.319 | 2.182 | 0.564 |
| 0.411000000000001 | 4.304 | 2.179 | 0.565 |
| 0.412000000000001 | 4.289 | 2.176 | 0.565 |
| 0.413000000000001 | 4.274 | 2.173 | 0.566 |
| 0.414000000000001 | 4.259 | 2.17 | 0.566 |
| 0.415000000000001 | 4.245 | 2.167 | 0.567 |
| 0.416000000000001 | 4.23 | 2.164 | 0.567 |
| 0.417000000000001 | 4.216 | 2.161 | 0.568 |
| 0.418000000000001 | 4.201 | 2.158 | 0.568 |
| 0.419000000000001 | 4.187 | 2.156 | 0.569 |
| 0.420000000000001 | 4.172 | 2.153 | 0.569 |
| 0.421000000000001 | 4.158 | 2.15 | 0.57 |
| 0.422000000000001 | 4.144 | 2.147 | 0.57 |
| 0.423000000000001 | 4.129 | 2.144 | 0.571 |
| 0.424000000000001 | 4.115 | 2.141 | 0.571 |
| 0.425000000000001 | 4.101 | 2.138 | 0.572 |
| 0.426000000000001 | 4.087 | 2.135 | 0.572 |
| 0.427000000000001 | 4.073 | 2.132 | 0.573 |
| 0.428000000000001 | 4.059 | 2.129 | 0.573 |
| 0.429000000000001 | 4.045 | 2.126 | 0.574 |
| 0.430000000000001 | 4.032 | 2.123 | 0.574 |
| 0.431000000000001 | 4.018 | 2.12 | 0.574 |
| 0.432000000000001 | 4.004 | 2.117 | 0.575 |
| 0.433000000000001 | 3.991 | 2.114 | 0.575 |
| 0.434000000000001 | 3.977 | 2.111 | 0.576 |
| 0.435000000000001 | 3.964 | 2.108 | 0.576 |
| 0.436000000000001 | 3.95 | 2.105 | 0.576 |
| 0.437000000000001 | 3.937 | 2.102 | 0.577 |
| 0.438000000000001 | 3.924 | 2.099 | 0.577 |
| 0.439000000000001 | 3.91 | 2.096 | 0.578 |
| 0.440000000000001 | 3.897 | 2.093 | 0.578 |
| 0.441000000000001 | 3.884 | 2.09 | 0.579 |
| 0.442000000000001 | 3.871 | 2.086 | 0.579 |
| 0.443000000000001 | 3.858 | 2.083 | 0.579 |
| 0.444000000000001 | 3.845 | 2.08 | 0.58 |
| 0.445000000000001 | 3.832 | 2.077 | 0.58 |
| 0.446000000000001 | 3.819 | 2.074 | 0.58 |
| 0.447000000000001 | 3.806 | 2.071 | 0.581 |
| 0.448000000000001 | 3.794 | 2.068 | 0.581 |
| 0.449000000000001 | 3.781 | 2.065 | 0.582 |
| 0.450000000000001 | 3.768 | 2.062 | 0.582 |
| 0.451000000000001 | 3.756 | 2.059 | 0.582 |
| 0.452000000000001 | 3.743 | 2.056 | 0.583 |
| 0.453000000000001 | 3.731 | 2.053 | 0.583 |
| 0.454000000000001 | 3.718 | 2.049 | 0.583 |
| 0.455000000000001 | 3.706 | 2.046 | 0.584 |
| 0.456000000000001 | 3.694 | 2.043 | 0.584 |
| 0.457000000000001 | 3.681 | 2.04 | 0.584 |
| 0.458000000000001 | 3.669 | 2.037 | 0.585 |
| 0.459000000000001 | 3.657 | 2.034 | 0.585 |
| 0.460000000000001 | 3.645 | 2.031 | 0.585 |
| 0.461000000000001 | 3.633 | 2.028 | 0.586 |
| 0.462000000000001 | 3.621 | 2.024 | 0.586 |
| 0.463000000000001 | 3.609 | 2.021 | 0.586 |
| 0.464000000000001 | 3.597 | 2.018 | 0.587 |
| 0.465000000000001 | 3.585 | 2.015 | 0.587 |
| 0.466000000000001 | 3.573 | 2.012 | 0.587 |
| 0.467000000000001 | 3.562 | 2.009 | 0.588 |
| 0.468000000000001 | 3.55 | 2.006 | 0.588 |
| 0.469000000000001 | 3.538 | 2.002 | 0.588 |
| 0.470000000000001 | 3.527 | 1.999 | 0.588 |
| 0.471000000000001 | 3.515 | 1.996 | 0.589 |
| 0.472000000000001 | 3.504 | 1.993 | 0.589 |
| 0.473000000000001 | 3.492 | 1.99 | 0.589 |
| 0.474000000000001 | 3.481 | 1.987 | 0.59 |
| 0.475000000000001 | 3.47 | 1.984 | 0.59 |
| 0.476000000000001 | 3.458 | 1.98 | 0.59 |
| 0.477000000000001 | 3.447 | 1.977 | 0.59 |
| 0.478000000000001 | 3.436 | 1.974 | 0.591 |
| 0.479000000000001 | 3.425 | 1.971 | 0.591 |
| 0.480000000000001 | 3.414 | 1.968 | 0.591 |
| 0.481000000000001 | 3.403 | 1.965 | 0.591 |
| 0.482000000000001 | 3.392 | 1.961 | 0.592 |
| 0.483000000000001 | 3.381 | 1.958 | 0.592 |
| 0.484000000000001 | 3.37 | 1.955 | 0.592 |
| 0.485000000000001 | 3.359 | 1.952 | 0.592 |
| 0.486000000000001 | 3.348 | 1.949 | 0.593 |
| 0.487000000000001 | 3.337 | 1.946 | 0.593 |
| 0.488000000000001 | 3.327 | 1.942 | 0.593 |
| 0.489000000000001 | 3.316 | 1.939 | 0.593 |
| 0.490000000000001 | 3.305 | 1.936 | 0.593 |
| 0.491000000000001 | 3.295 | 1.933 | 0.594 |
| 0.492000000000001 | 3.284 | 1.93 | 0.594 |
| 0.493000000000001 | 3.274 | 1.927 | 0.594 |
| 0.494000000000001 | 3.263 | 1.924 | 0.594 |
| 0.495000000000001 | 3.253 | 1.92 | 0.595 |
| 0.496000000000001 | 3.243 | 1.917 | 0.595 |
| 0.497000000000001 | 3.232 | 1.914 | 0.595 |
| 0.498000000000001 | 3.222 | 1.911 | 0.595 |
| 0.499000000000001 | 3.212 | 1.908 | 0.595 |
| 0.500000000000001 | 3.202 | 1.905 | 0.596 |
| 0.501000000000001 | 3.192 | 1.901 | 0.596 |
| 0.502000000000001 | 3.181 | 1.898 | 0.596 |
| 0.503000000000001 | 3.171 | 1.895 | 0.596 |
| 0.504000000000001 | 3.161 | 1.892 | 0.596 |
| 0.505000000000001 | 3.151 | 1.889 | 0.596 |
| 0.506000000000001 | 3.141 | 1.886 | 0.597 |
| 0.507000000000001 | 3.132 | 1.882 | 0.597 |
| 0.508000000000001 | 3.122 | 1.879 | 0.597 |
| 0.509000000000001 | 3.112 | 1.876 | 0.597 |
| 0.510000000000001 | 3.102 | 1.873 | 0.597 |
| 0.511000000000001 | 3.092 | 1.87 | 0.597 |
| 0.512000000000001 | 3.083 | 1.867 | 0.598 |
| 0.513000000000001 | 3.073 | 1.864 | 0.598 |
| 0.514000000000001 | 3.064 | 1.86 | 0.598 |
| 0.515000000000001 | 3.054 | 1.857 | 0.598 |
| 0.516000000000001 | 3.045 | 1.854 | 0.598 |
| 0.517000000000001 | 3.035 | 1.851 | 0.598 |
| 0.518000000000001 | 3.026 | 1.848 | 0.598 |
| 0.519000000000001 | 3.016 | 1.845 | 0.598 |
| 0.520000000000001 | 3.007 | 1.842 | 0.599 |
| 0.521000000000001 | 2.998 | 1.838 | 0.599 |
| 0.522000000000001 | 2.988 | 1.835 | 0.599 |
| 0.523000000000001 | 2.979 | 1.832 | 0.599 |
| 0.524000000000001 | 2.97 | 1.829 | 0.599 |
| 0.525000000000001 | 2.961 | 1.826 | 0.599 |
| 0.526000000000001 | 2.952 | 1.823 | 0.599 |
| 0.527000000000001 | 2.943 | 1.82 | 0.599 |
| 0.528000000000001 | 2.934 | 1.817 | 0.6 |
| 0.529000000000001 | 2.925 | 1.813 | 0.6 |
| 0.530000000000001 | 2.916 | 1.81 | 0.6 |
| 0.531000000000001 | 2.907 | 1.807 | 0.6 |
| 0.532000000000001 | 2.898 | 1.804 | 0.6 |
| 0.533000000000001 | 2.889 | 1.801 | 0.6 |
| 0.534000000000001 | 2.88 | 1.798 | 0.6 |
| 0.535000000000001 | 2.871 | 1.795 | 0.6 |
| 0.536000000000001 | 2.863 | 1.792 | 0.6 |
| 0.537000000000001 | 2.854 | 1.789 | 0.6 |
| 0.538000000000001 | 2.845 | 1.786 | 0.6 |
| 0.539000000000001 | 2.837 | 1.782 | 0.6 |
| 0.540000000000001 | 2.828 | 1.779 | 0.601 |
| 0.541000000000001 | 2.819 | 1.776 | 0.601 |
| 0.542000000000001 | 2.811 | 1.773 | 0.601 |
| 0.543000000000001 | 2.802 | 1.77 | 0.601 |
| 0.544000000000001 | 2.794 | 1.767 | 0.601 |
| 0.545000000000001 | 2.786 | 1.764 | 0.601 |
| 0.546000000000001 | 2.777 | 1.761 | 0.601 |
| 0.547000000000001 | 2.769 | 1.758 | 0.601 |
| 0.548000000000001 | 2.76 | 1.755 | 0.601 |
| 0.549000000000001 | 2.752 | 1.752 | 0.601 |
| 0.550000000000001 | 2.744 | 1.749 | 0.601 |
| 0.551000000000001 | 2.736 | 1.746 | 0.601 |
| 0.552000000000001 | 2.728 | 1.743 | 0.601 |
| 0.553000000000001 | 2.719 | 1.739 | 0.601 |
| 0.554000000000001 | 2.711 | 1.736 | 0.601 |
| 0.555000000000001 | 2.703 | 1.733 | 0.601 |
| 0.556000000000001 | 2.695 | 1.73 | 0.601 |
| 0.557000000000001 | 2.687 | 1.727 | 0.601 |
| 0.558000000000001 | 2.679 | 1.724 | 0.601 |
| 0.559000000000001 | 2.671 | 1.721 | 0.601 |
| 0.560000000000001 | 2.663 | 1.718 | 0.601 |
| 0.561000000000001 | 2.655 | 1.715 | 0.601 |
| 0.562000000000001 | 2.648 | 1.712 | 0.601 |
| 0.563000000000001 | 2.64 | 1.709 | 0.601 |
| 0.564000000000001 | 2.632 | 1.706 | 0.601 |
| 0.565000000000001 | 2.624 | 1.703 | 0.601 |
| 0.566000000000001 | 2.616 | 1.7 | 0.601 |
| 0.567000000000001 | 2.609 | 1.697 | 0.601 |
| 0.568000000000001 | 2.601 | 1.694 | 0.601 |
| 0.569000000000001 | 2.594 | 1.691 | 0.601 |
| 0.570000000000001 | 2.586 | 1.688 | 0.601 |
| 0.571000000000001 | 2.578 | 1.685 | 0.601 |
| 0.572000000000001 | 2.571 | 1.682 | 0.601 |
| 0.573000000000001 | 2.563 | 1.679 | 0.601 |
| 0.574000000000001 | 2.556 | 1.676 | 0.601 |
| 0.575000000000001 | 2.548 | 1.673 | 0.601 |
| 0.576000000000001 | 2.541 | 1.67 | 0.601 |
| 0.577000000000001 | 2.534 | 1.667 | 0.601 |
| 0.578000000000001 | 2.526 | 1.664 | 0.601 |
| 0.579000000000001 | 2.519 | 1.661 | 0.601 |
| 0.580000000000001 | 2.512 | 1.658 | 0.601 |
| 0.581000000000001 | 2.504 | 1.655 | 0.601 |
| 0.582000000000001 | 2.497 | 1.652 | 0.601 |
| 0.583000000000001 | 2.49 | 1.65 | 0.601 |
| 0.584000000000001 | 2.483 | 1.647 | 0.601 |
| 0.585000000000001 | 2.476 | 1.644 | 0.601 |
| 0.586000000000001 | 2.468 | 1.641 | 0.601 |
| 0.587000000000001 | 2.461 | 1.638 | 0.601 |
| 0.588000000000001 | 2.454 | 1.635 | 0.601 |
| 0.589000000000001 | 2.447 | 1.632 | 0.601 |
| 0.590000000000001 | 2.44 | 1.629 | 0.601 |
| 0.591000000000001 | 2.433 | 1.626 | 0.601 |
| 0.592000000000001 | 2.426 | 1.623 | 0.601 |
| 0.593000000000001 | 2.419 | 1.62 | 0.601 |
| 0.594000000000001 | 2.413 | 1.617 | 0.6 |
| 0.595000000000001 | 2.406 | 1.615 | 0.6 |
| 0.596000000000001 | 2.399 | 1.612 | 0.6 |
| 0.597000000000001 | 2.392 | 1.609 | 0.6 |
| 0.598000000000001 | 2.385 | 1.606 | 0.6 |
| 0.599000000000001 | 2.378 | 1.603 | 0.6 |
| 0.600000000000001 | 2.372 | 1.6 | 0.6 |
| 0.601000000000001 | 2.365 | 1.597 | 0.6 |
| 0.602000000000001 | 2.358 | 1.594 | 0.6 |
| 0.603000000000001 | 2.352 | 1.592 | 0.6 |
| 0.604000000000001 | 2.345 | 1.589 | 0.6 |
| 0.605000000000001 | 2.338 | 1.586 | 0.6 |
| 0.606000000000001 | 2.332 | 1.583 | 0.599 |
| 0.607000000000001 | 2.325 | 1.58 | 0.599 |
| 0.608000000000001 | 2.319 | 1.577 | 0.599 |
| 0.609000000000001 | 2.312 | 1.574 | 0.599 |
| 0.610000000000001 | 2.306 | 1.572 | 0.599 |
| 0.611000000000001 | 2.299 | 1.569 | 0.599 |
| 0.612000000000001 | 2.293 | 1.566 | 0.599 |
| 0.613000000000001 | 2.287 | 1.563 | 0.599 |
| 0.614000000000001 | 2.28 | 1.56 | 0.599 |
| 0.615000000000001 | 2.274 | 1.558 | 0.599 |
| 0.616000000000001 | 2.268 | 1.555 | 0.598 |
| 0.617000000000001 | 2.261 | 1.552 | 0.598 |
| 0.618000000000001 | 2.255 | 1.549 | 0.598 |
| 0.619000000000001 | 2.249 | 1.546 | 0.598 |
| 0.620000000000001 | 2.242 | 1.544 | 0.598 |
| 0.621000000000001 | 2.236 | 1.541 | 0.598 |
| 0.622000000000001 | 2.23 | 1.538 | 0.598 |
| 0.623000000000001 | 2.224 | 1.535 | 0.598 |
| 0.624000000000001 | 2.218 | 1.532 | 0.597 |
| 0.625000000000001 | 2.212 | 1.53 | 0.597 |
| 0.626000000000001 | 2.206 | 1.527 | 0.597 |
| 0.627000000000001 | 2.2 | 1.524 | 0.597 |
| 0.628000000000001 | 2.194 | 1.521 | 0.597 |
| 0.629000000000001 | 2.188 | 1.519 | 0.597 |
| 0.630000000000001 | 2.182 | 1.516 | 0.597 |
| 0.631000000000001 | 2.176 | 1.513 | 0.597 |
| 0.632000000000001 | 2.17 | 1.51 | 0.596 |
| 0.633000000000001 | 2.164 | 1.508 | 0.596 |
| 0.634000000000001 | 2.158 | 1.505 | 0.596 |
| 0.635000000000001 | 2.152 | 1.502 | 0.596 |
| 0.636000000000001 | 2.146 | 1.5 | 0.596 |
| 0.637000000000001 | 2.14 | 1.497 | 0.596 |
| 0.638000000000001 | 2.134 | 1.494 | 0.595 |
| 0.639000000000001 | 2.129 | 1.491 | 0.595 |
| 0.640000000000001 | 2.123 | 1.489 | 0.595 |
| 0.641000000000001 | 2.117 | 1.486 | 0.595 |
| 0.642000000000001 | 2.111 | 1.483 | 0.595 |
| 0.643000000000001 | 2.106 | 1.481 | 0.595 |
| 0.644000000000001 | 2.1 | 1.478 | 0.595 |
| 0.645000000000001 | 2.094 | 1.475 | 0.594 |
| 0.646000000000001 | 2.089 | 1.473 | 0.594 |
| 0.647000000000001 | 2.083 | 1.47 | 0.594 |
| 0.648000000000001 | 2.078 | 1.467 | 0.594 |
| 0.649000000000001 | 2.072 | 1.465 | 0.594 |
| 0.650000000000001 | 2.067 | 1.462 | 0.593 |
| 0.651000000000001 | 2.061 | 1.459 | 0.593 |
| 0.652000000000001 | 2.056 | 1.457 | 0.593 |
| 0.653000000000001 | 2.05 | 1.454 | 0.593 |
| 0.654000000000001 | 2.045 | 1.452 | 0.593 |
| 0.655000000000001 | 2.039 | 1.449 | 0.593 |
| 0.656000000000001 | 2.034 | 1.446 | 0.592 |
| 0.657000000000001 | 2.028 | 1.444 | 0.592 |
| 0.658000000000001 | 2.023 | 1.441 | 0.592 |
| 0.659000000000001 | 2.018 | 1.438 | 0.592 |
| 0.660000000000001 | 2.012 | 1.436 | 0.592 |
| 0.661000000000001 | 2.007 | 1.433 | 0.591 |
| 0.662000000000001 | 2.002 | 1.431 | 0.591 |
| 0.663000000000001 | 1.996 | 1.428 | 0.591 |
| 0.664000000000001 | 1.991 | 1.426 | 0.591 |
| 0.665000000000001 | 1.986 | 1.423 | 0.591 |
| 0.666000000000001 | 1.981 | 1.42 | 0.59 |
| 0.667000000000001 | 1.975 | 1.418 | 0.59 |
| 0.668000000000001 | 1.97 | 1.415 | 0.59 |
| 0.669000000000001 | 1.965 | 1.413 | 0.59 |
| 0.670000000000001 | 1.96 | 1.41 | 0.59 |
| 0.671000000000001 | 1.955 | 1.408 | 0.589 |
| 0.672000000000001 | 1.95 | 1.405 | 0.589 |
| 0.673000000000001 | 1.945 | 1.402 | 0.589 |
| 0.674000000000001 | 1.94 | 1.4 | 0.589 |
| 0.675000000000001 | 1.935 | 1.397 | 0.589 |
| 0.676000000000001 | 1.929 | 1.395 | 0.588 |
| 0.677000000000001 | 1.924 | 1.392 | 0.588 |
| 0.678000000000001 | 1.919 | 1.39 | 0.588 |
| 0.679000000000001 | 1.915 | 1.387 | 0.588 |
| 0.680000000000001 | 1.91 | 1.385 | 0.587 |
| 0.681000000000001 | 1.905 | 1.382 | 0.587 |
| 0.682000000000001 | 1.9 | 1.38 | 0.587 |
| 0.683000000000001 | 1.895 | 1.377 | 0.587 |
| 0.684000000000001 | 1.89 | 1.375 | 0.587 |
| 0.685000000000001 | 1.885 | 1.372 | 0.586 |
| 0.686000000000001 | 1.88 | 1.37 | 0.586 |
| 0.687000000000001 | 1.875 | 1.367 | 0.586 |
| 0.688000000000001 | 1.871 | 1.365 | 0.586 |
| 0.689000000000001 | 1.866 | 1.363 | 0.585 |
| 0.690000000000001 | 1.861 | 1.36 | 0.585 |
| 0.691000000000001 | 1.856 | 1.358 | 0.585 |
| 0.692000000000001 | 1.852 | 1.355 | 0.585 |
| 0.693000000000001 | 1.847 | 1.353 | 0.584 |
| 0.694000000000001 | 1.842 | 1.35 | 0.584 |
| 0.695000000000001 | 1.837 | 1.348 | 0.584 |
| 0.696000000000001 | 1.833 | 1.345 | 0.584 |
| 0.697000000000001 | 1.828 | 1.343 | 0.583 |
| 0.698000000000001 | 1.823 | 1.341 | 0.583 |
| 0.699000000000001 | 1.819 | 1.338 | 0.583 |
| 0.700000000000001 | 1.814 | 1.336 | 0.583 |
| 0.701000000000001 | 1.81 | 1.333 | 0.582 |
| 0.702000000000001 | 1.805 | 1.331 | 0.582 |
| 0.703000000000001 | 1.8 | 1.329 | 0.582 |
| 0.704000000000001 | 1.796 | 1.326 | 0.582 |
| 0.705000000000001 | 1.791 | 1.324 | 0.581 |
| 0.706000000000001 | 1.787 | 1.321 | 0.581 |
| 0.707000000000001 | 1.782 | 1.319 | 0.581 |
| 0.708000000000001 | 1.778 | 1.317 | 0.581 |
| 0.709000000000001 | 1.773 | 1.314 | 0.58 |
| 0.710000000000001 | 1.769 | 1.312 | 0.58 |
| 0.711000000000001 | 1.765 | 1.31 | 0.58 |
| 0.712000000000001 | 1.76 | 1.307 | 0.58 |
| 0.713000000000001 | 1.756 | 1.305 | 0.579 |
| 0.714000000000001 | 1.751 | 1.303 | 0.579 |
| 0.715000000000001 | 1.747 | 1.3 | 0.579 |
| 0.716000000000001 | 1.743 | 1.298 | 0.579 |
| 0.717000000000001 | 1.738 | 1.296 | 0.578 |
| 0.718000000000001 | 1.734 | 1.293 | 0.578 |
| 0.719000000000001 | 1.73 | 1.291 | 0.578 |
| 0.720000000000001 | 1.725 | 1.289 | 0.577 |
| 0.721000000000001 | 1.721 | 1.286 | 0.577 |
| 0.722000000000001 | 1.717 | 1.284 | 0.577 |
| 0.723000000000001 | 1.713 | 1.282 | 0.577 |
| 0.724000000000001 | 1.709 | 1.279 | 0.576 |
| 0.725000000000001 | 1.704 | 1.277 | 0.576 |
| 0.726000000000001 | 1.7 | 1.275 | 0.576 |
| 0.727000000000001 | 1.696 | 1.272 | 0.576 |
| 0.728000000000001 | 1.692 | 1.27 | 0.575 |
| 0.729000000000001 | 1.688 | 1.268 | 0.575 |
| 0.730000000000001 | 1.683 | 1.266 | 0.575 |
| 0.731000000000001 | 1.679 | 1.263 | 0.574 |
| 0.732000000000001 | 1.675 | 1.261 | 0.574 |
| 0.733000000000001 | 1.671 | 1.259 | 0.574 |
| 0.734000000000001 | 1.667 | 1.257 | 0.574 |
| 0.735000000000001 | 1.663 | 1.254 | 0.573 |
| 0.736000000000001 | 1.659 | 1.252 | 0.573 |
| 0.737000000000001 | 1.655 | 1.25 | 0.573 |
| 0.738000000000001 | 1.651 | 1.248 | 0.572 |
| 0.739000000000001 | 1.647 | 1.245 | 0.572 |
| 0.740000000000001 | 1.643 | 1.243 | 0.572 |
| 0.741000000000001 | 1.639 | 1.241 | 0.571 |
| 0.742000000000001 | 1.635 | 1.239 | 0.571 |
| 0.743000000000001 | 1.631 | 1.237 | 0.571 |
| 0.744000000000001 | 1.627 | 1.234 | 0.571 |
| 0.745000000000001 | 1.623 | 1.232 | 0.57 |
| 0.746000000000001 | 1.619 | 1.23 | 0.57 |
| 0.747000000000001 | 1.615 | 1.228 | 0.57 |
| 0.748000000000001 | 1.611 | 1.226 | 0.569 |
| 0.749000000000001 | 1.608 | 1.223 | 0.569 |
| 0.750000000000001 | 1.604 | 1.221 | 0.569 |
| 0.751000000000001 | 1.6 | 1.219 | 0.568 |
| 0.752000000000001 | 1.596 | 1.217 | 0.568 |
| 0.753000000000001 | 1.592 | 1.215 | 0.568 |
| 0.754000000000001 | 1.588 | 1.213 | 0.568 |
| 0.755000000000001 | 1.585 | 1.21 | 0.567 |
| 0.756000000000001 | 1.581 | 1.208 | 0.567 |
| 0.757000000000001 | 1.577 | 1.206 | 0.567 |
| 0.758000000000001 | 1.573 | 1.204 | 0.566 |
| 0.759000000000001 | 1.57 | 1.202 | 0.566 |
| 0.760000000000001 | 1.566 | 1.2 | 0.566 |
| 0.761000000000001 | 1.562 | 1.198 | 0.565 |
| 0.762000000000001 | 1.558 | 1.195 | 0.565 |
| 0.763000000000001 | 1.555 | 1.193 | 0.565 |
| 0.764000000000001 | 1.551 | 1.191 | 0.564 |
| 0.765000000000001 | 1.547 | 1.189 | 0.564 |
| 0.766000000000001 | 1.544 | 1.187 | 0.564 |
| 0.767000000000001 | 1.54 | 1.185 | 0.563 |
| 0.768000000000001 | 1.536 | 1.183 | 0.563 |
| 0.769000000000001 | 1.533 | 1.181 | 0.563 |
| 0.770000000000001 | 1.529 | 1.179 | 0.562 |
| 0.771000000000001 | 1.526 | 1.177 | 0.562 |
| 0.772000000000001 | 1.522 | 1.174 | 0.562 |
| 0.773000000000001 | 1.519 | 1.172 | 0.561 |
| 0.774000000000001 | 1.515 | 1.17 | 0.561 |
| 0.775000000000001 | 1.511 | 1.168 | 0.561 |
| 0.776000000000001 | 1.508 | 1.166 | 0.561 |
| 0.777000000000001 | 1.504 | 1.164 | 0.56 |
| 0.778000000000001 | 1.501 | 1.162 | 0.56 |
| 0.779000000000001 | 1.497 | 1.16 | 0.56 |
| 0.780000000000001 | 1.494 | 1.158 | 0.559 |
| 0.781000000000001 | 1.49 | 1.156 | 0.559 |
| 0.782000000000001 | 1.487 | 1.154 | 0.559 |
| 0.783000000000001 | 1.484 | 1.152 | 0.558 |
| 0.784000000000001 | 1.48 | 1.15 | 0.558 |
| 0.785000000000001 | 1.477 | 1.148 | 0.558 |
| 0.786000000000001 | 1.473 | 1.146 | 0.557 |
| 0.787000000000001 | 1.47 | 1.144 | 0.557 |
| 0.788000000000001 | 1.466 | 1.142 | 0.557 |
| 0.789000000000001 | 1.463 | 1.14 | 0.556 |
| 0.790000000000001 | 1.46 | 1.138 | 0.556 |
| 0.791000000000001 | 1.456 | 1.136 | 0.556 |
| 0.792000000000001 | 1.453 | 1.134 | 0.555 |
| 0.793000000000001 | 1.45 | 1.132 | 0.555 |
| 0.794000000000001 | 1.446 | 1.13 | 0.554 |
| 0.795000000000001 | 1.443 | 1.128 | 0.554 |
| 0.796000000000001 | 1.44 | 1.126 | 0.554 |
| 0.797000000000001 | 1.436 | 1.124 | 0.553 |
| 0.798000000000001 | 1.433 | 1.122 | 0.553 |
| 0.799000000000001 | 1.43 | 1.12 | 0.553 |
| 0.800000000000001 | 1.427 | 1.118 | 0.552 |
| 0.801000000000001 | 1.423 | 1.116 | 0.552 |
| 0.802000000000001 | 1.42 | 1.114 | 0.552 |
| 0.803000000000001 | 1.417 | 1.112 | 0.551 |
| 0.804000000000001 | 1.414 | 1.11 | 0.551 |
| 0.805000000000001 | 1.411 | 1.108 | 0.551 |
| 0.806000000000001 | 1.407 | 1.106 | 0.55 |
| 0.807000000000001 | 1.404 | 1.104 | 0.55 |
| 0.808000000000001 | 1.401 | 1.103 | 0.55 |
| 0.809000000000001 | 1.398 | 1.101 | 0.549 |
| 0.810000000000001 | 1.395 | 1.099 | 0.549 |
| 0.811000000000001 | 1.392 | 1.097 | 0.549 |
| 0.812000000000001 | 1.388 | 1.095 | 0.548 |
| 0.813000000000001 | 1.385 | 1.093 | 0.548 |
| 0.814000000000001 | 1.382 | 1.091 | 0.548 |
| 0.815000000000001 | 1.379 | 1.089 | 0.547 |
| 0.816000000000001 | 1.376 | 1.087 | 0.547 |
| 0.817000000000001 | 1.373 | 1.085 | 0.546 |
| 0.818000000000001 | 1.37 | 1.083 | 0.546 |
| 0.819000000000001 | 1.367 | 1.082 | 0.546 |
| 0.820000000000001 | 1.364 | 1.08 | 0.545 |
| 0.821000000000001 | 1.361 | 1.078 | 0.545 |
| 0.822000000000001 | 1.358 | 1.076 | 0.545 |
| 0.823000000000001 | 1.355 | 1.074 | 0.544 |
| 0.824000000000001 | 1.352 | 1.072 | 0.544 |
| 0.825000000000001 | 1.349 | 1.07 | 0.544 |
| 0.826000000000001 | 1.346 | 1.069 | 0.543 |
| 0.827000000000001 | 1.343 | 1.067 | 0.543 |
| 0.828000000000001 | 1.34 | 1.065 | 0.543 |
| 0.829000000000001 | 1.337 | 1.063 | 0.542 |
| 0.830000000000001 | 1.334 | 1.061 | 0.542 |
| 0.831000000000001 | 1.331 | 1.059 | 0.541 |
| 0.832000000000001 | 1.328 | 1.058 | 0.541 |
| 0.833000000000001 | 1.325 | 1.056 | 0.541 |
| 0.834000000000001 | 1.322 | 1.054 | 0.54 |
| 0.835000000000001 | 1.319 | 1.052 | 0.54 |
| 0.836000000000001 | 1.316 | 1.05 | 0.54 |
| 0.837000000000001 | 1.313 | 1.048 | 0.539 |
| 0.838000000000001 | 1.31 | 1.047 | 0.539 |
| 0.839000000000001 | 1.308 | 1.045 | 0.539 |
| 0.840000000000001 | 1.305 | 1.043 | 0.538 |
| 0.841000000000001 | 1.302 | 1.041 | 0.538 |
| 0.842000000000001 | 1.299 | 1.039 | 0.537 |
| 0.843000000000001 | 1.296 | 1.038 | 0.537 |
| 0.844000000000001 | 1.293 | 1.036 | 0.537 |
| 0.845000000000001 | 1.291 | 1.034 | 0.536 |
| 0.846000000000001 | 1.288 | 1.032 | 0.536 |
| 0.847000000000001 | 1.285 | 1.031 | 0.536 |
| 0.848000000000001 | 1.282 | 1.029 | 0.535 |
| 0.849000000000001 | 1.279 | 1.027 | 0.535 |
| 0.850000000000001 | 1.277 | 1.025 | 0.534 |
| 0.851000000000001 | 1.274 | 1.024 | 0.534 |
| 0.852000000000001 | 1.271 | 1.022 | 0.534 |
| 0.853000000000001 | 1.268 | 1.02 | 0.533 |
| 0.854000000000001 | 1.266 | 1.018 | 0.533 |
| 0.855000000000001 | 1.263 | 1.017 | 0.533 |
| 0.856000000000001 | 1.26 | 1.015 | 0.532 |
| 0.857000000000001 | 1.257 | 1.013 | 0.532 |
| 0.858000000000001 | 1.255 | 1.011 | 0.531 |
| 0.859000000000001 | 1.252 | 1.01 | 0.531 |
| 0.860000000000001 | 1.249 | 1.008 | 0.531 |
| 0.861000000000001 | 1.247 | 1.006 | 0.53 |
| 0.862000000000001 | 1.244 | 1.004 | 0.53 |
| 0.863000000000001 | 1.241 | 1.003 | 0.53 |
| 0.864000000000001 | 1.239 | 1.001 | 0.529 |
| 0.865000000000001 | 1.236 | 0.999 | 0.529 |
| 0.866000000000001 | 1.233 | 0.998 | 0.528 |
| 0.867000000000001 | 1.231 | 0.996 | 0.528 |
| 0.868000000000001 | 1.228 | 0.994 | 0.528 |
| 0.869000000000001 | 1.226 | 0.993 | 0.527 |
| 0.870000000000001 | 1.223 | 0.991 | 0.527 |
| 0.871000000000001 | 1.22 | 0.989 | 0.527 |
| 0.872000000000002 | 1.218 | 0.988 | 0.526 |
| 0.873000000000002 | 1.215 | 0.986 | 0.526 |
| 0.874000000000002 | 1.213 | 0.984 | 0.525 |
| 0.875000000000002 | 1.21 | 0.983 | 0.525 |
| 0.876000000000002 | 1.208 | 0.981 | 0.525 |
| 0.877000000000002 | 1.205 | 0.979 | 0.524 |
| 0.878000000000002 | 1.202 | 0.978 | 0.524 |
| 0.879000000000002 | 1.2 | 0.976 | 0.524 |
| 0.880000000000001 | 1.197 | 0.974 | 0.523 |
| 0.881000000000001 | 1.195 | 0.973 | 0.523 |
| 0.882000000000002 | 1.192 | 0.971 | 0.522 |
| 0.883000000000002 | 1.19 | 0.969 | 0.522 |
| 0.884000000000002 | 1.187 | 0.968 | 0.522 |
| 0.885000000000002 | 1.185 | 0.966 | 0.521 |
| 0.886000000000002 | 1.182 | 0.964 | 0.521 |
| 0.887000000000002 | 1.18 | 0.963 | 0.52 |
| 0.888000000000002 | 1.177 | 0.961 | 0.52 |
| 0.889000000000002 | 1.175 | 0.96 | 0.52 |
| 0.890000000000001 | 1.173 | 0.958 | 0.519 |
| 0.891000000000001 | 1.17 | 0.956 | 0.519 |
| 0.892000000000002 | 1.168 | 0.955 | 0.519 |
| 0.893000000000002 | 1.165 | 0.953 | 0.518 |
| 0.894000000000002 | 1.163 | 0.952 | 0.518 |
| 0.895000000000002 | 1.16 | 0.95 | 0.517 |
| 0.896000000000002 | 1.158 | 0.948 | 0.517 |
| 0.897000000000002 | 1.156 | 0.947 | 0.517 |
| 0.898000000000002 | 1.153 | 0.945 | 0.516 |
| 0.899000000000002 | 1.151 | 0.944 | 0.516 |
| 0.900000000000002 | 1.148 | 0.942 | 0.515 |
| 0.901000000000002 | 1.146 | 0.94 | 0.515 |
| 0.902000000000002 | 1.144 | 0.939 | 0.515 |
| 0.903000000000002 | 1.141 | 0.937 | 0.514 |
| 0.904000000000002 | 1.139 | 0.936 | 0.514 |
| 0.905000000000002 | 1.137 | 0.934 | 0.514 |
| 0.906000000000002 | 1.134 | 0.933 | 0.513 |
| 0.907000000000002 | 1.132 | 0.931 | 0.513 |
| 0.908000000000002 | 1.13 | 0.93 | 0.512 |
| 0.909000000000002 | 1.127 | 0.928 | 0.512 |
| 0.910000000000002 | 1.125 | 0.926 | 0.512 |
| 0.911000000000002 | 1.123 | 0.925 | 0.511 |
| 0.912000000000002 | 1.12 | 0.923 | 0.511 |
| 0.913000000000002 | 1.118 | 0.922 | 0.51 |
| 0.914000000000002 | 1.116 | 0.92 | 0.51 |
| 0.915000000000002 | 1.114 | 0.919 | 0.51 |
| 0.916000000000002 | 1.111 | 0.917 | 0.509 |
| 0.917000000000002 | 1.109 | 0.916 | 0.509 |
| 0.918000000000002 | 1.107 | 0.914 | 0.508 |
| 0.919000000000002 | 1.105 | 0.913 | 0.508 |
| 0.920000000000002 | 1.102 | 0.911 | 0.508 |
| 0.921000000000002 | 1.1 | 0.91 | 0.507 |
| 0.922000000000002 | 1.098 | 0.908 | 0.507 |
| 0.923000000000002 | 1.096 | 0.907 | 0.507 |
| 0.924000000000002 | 1.094 | 0.905 | 0.506 |
| 0.925000000000002 | 1.091 | 0.904 | 0.506 |
| 0.926000000000002 | 1.089 | 0.902 | 0.505 |
| 0.927000000000002 | 1.087 | 0.901 | 0.505 |
| 0.928000000000002 | 1.085 | 0.899 | 0.505 |
| 0.929000000000002 | 1.083 | 0.898 | 0.504 |
| 0.930000000000002 | 1.08 | 0.896 | 0.504 |
| 0.931000000000002 | 1.078 | 0.895 | 0.503 |
| 0.932000000000002 | 1.076 | 0.893 | 0.503 |
| 0.933000000000002 | 1.074 | 0.892 | 0.503 |
| 0.934000000000002 | 1.072 | 0.89 | 0.502 |
| 0.935000000000002 | 1.07 | 0.889 | 0.502 |
| 0.936000000000002 | 1.067 | 0.888 | 0.501 |
| 0.937000000000002 | 1.065 | 0.886 | 0.501 |
| 0.938000000000002 | 1.063 | 0.885 | 0.501 |
| 0.939000000000002 | 1.061 | 0.883 | 0.5 |
| 0.940000000000002 | 1.059 | 0.882 | 0.5 |
| 0.941000000000002 | 1.057 | 0.88 | 0.499 |
| 0.942000000000002 | 1.055 | 0.879 | 0.499 |
| 0.943000000000002 | 1.053 | 0.877 | 0.499 |
| 0.944000000000002 | 1.051 | 0.876 | 0.498 |
| 0.945000000000002 | 1.049 | 0.875 | 0.498 |
| 0.946000000000002 | 1.046 | 0.873 | 0.497 |
| 0.947000000000002 | 1.044 | 0.872 | 0.497 |
| 0.948000000000002 | 1.042 | 0.87 | 0.497 |
| 0.949000000000002 | 1.04 | 0.869 | 0.496 |
| 0.950000000000002 | 1.038 | 0.867 | 0.496 |
| 0.951000000000002 | 1.036 | 0.866 | 0.495 |
| 0.952000000000002 | 1.034 | 0.865 | 0.495 |
| 0.953000000000002 | 1.032 | 0.863 | 0.495 |
| 0.954000000000002 | 1.03 | 0.862 | 0.494 |
| 0.955000000000002 | 1.028 | 0.86 | 0.494 |
| 0.956000000000002 | 1.026 | 0.859 | 0.494 |
| 0.957000000000002 | 1.024 | 0.858 | 0.493 |
| 0.958000000000002 | 1.022 | 0.856 | 0.493 |
| 0.959000000000002 | 1.02 | 0.855 | 0.492 |
| 0.960000000000002 | 1.018 | 0.853 | 0.492 |
| 0.961000000000002 | 1.016 | 0.852 | 0.492 |
| 0.962000000000002 | 1.014 | 0.851 | 0.491 |
| 0.963000000000002 | 1.012 | 0.849 | 0.491 |
| 0.964000000000002 | 1.01 | 0.848 | 0.49 |
| 0.965000000000002 | 1.008 | 0.847 | 0.49 |
| 0.966000000000002 | 1.006 | 0.845 | 0.49 |
| 0.967000000000002 | 1.004 | 0.844 | 0.489 |
| 0.968000000000002 | 1.002 | 0.842 | 0.489 |
| 0.969000000000002 | 1 | 0.841 | 0.488 |
| 0.970000000000002 | 0.998 | 0.84 | 0.488 |
| 0.971000000000002 | 0.997 | 0.838 | 0.488 |
| 0.972000000000002 | 0.995 | 0.837 | 0.487 |
| 0.973000000000002 | 0.993 | 0.836 | 0.487 |
| 0.974000000000002 | 0.991 | 0.834 | 0.486 |
| 0.975000000000002 | 0.989 | 0.833 | 0.486 |
| 0.976000000000002 | 0.987 | 0.832 | 0.486 |
| 0.977000000000002 | 0.985 | 0.83 | 0.485 |
| 0.978000000000002 | 0.983 | 0.829 | 0.485 |
| 0.979000000000002 | 0.981 | 0.828 | 0.484 |
| 0.980000000000002 | 0.979 | 0.826 | 0.484 |
| 0.981000000000002 | 0.978 | 0.825 | 0.484 |
| 0.982000000000002 | 0.976 | 0.824 | 0.483 |
| 0.983000000000002 | 0.974 | 0.822 | 0.483 |
| 0.984000000000002 | 0.972 | 0.821 | 0.482 |
| 0.985000000000002 | 0.97 | 0.82 | 0.482 |
| 0.986000000000002 | 0.968 | 0.818 | 0.482 |
| 0.987000000000002 | 0.966 | 0.817 | 0.481 |
| 0.988000000000002 | 0.965 | 0.816 | 0.481 |
| 0.989000000000002 | 0.963 | 0.815 | 0.48 |
| 0.990000000000002 | 0.961 | 0.813 | 0.48 |
| 0.991000000000002 | 0.959 | 0.812 | 0.48 |
| 0.992000000000002 | 0.957 | 0.811 | 0.479 |
| 0.993000000000002 | 0.955 | 0.809 | 0.479 |
| 0.994000000000002 | 0.954 | 0.808 | 0.479 |
| 0.995000000000002 | 0.952 | 0.807 | 0.478 |
| 0.996000000000002 | 0.95 | 0.806 | 0.478 |
| 0.997000000000002 | 0.948 | 0.804 | 0.477 |
| 0.998000000000002 | 0.946 | 0.803 | 0.477 |
| 0.999000000000002 | 0.945 | 0.802 | 0.477 |
| 1.000000000000002 | 0.943 | 0.8 | 0.476 |